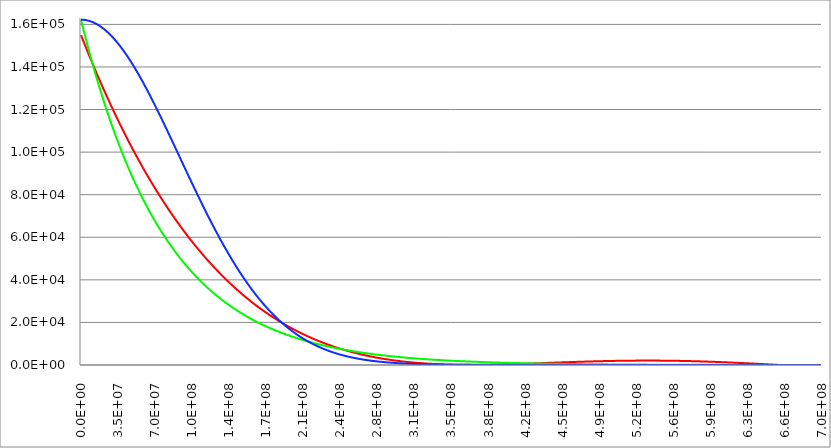
| Category | Series 1 | Series 0 | Series 2 |
|---|---|---|---|
| 0.0 | 155000 | 162200 | 162200 |
| 347850.0 | 154555.961 | 161490.775 | 162198.841 |
| 695700.0 | 154112.842 | 160784.651 | 162195.362 |
| 1043550.0 | 153670.644 | 160081.614 | 162189.565 |
| 1391400.0 | 153229.363 | 159381.651 | 162181.45 |
| 1739250.0 | 152789 | 158684.748 | 162171.017 |
| 2087100.0 | 152349.552 | 157990.891 | 162158.266 |
| 2434950.0 | 151911.019 | 157300.068 | 162143.197 |
| 2782800.0 | 151473.4 | 156612.265 | 162125.813 |
| 3130650.0 | 151036.693 | 155927.469 | 162106.113 |
| 3478500.0 | 150600.897 | 155245.667 | 162084.098 |
| 3826350.0 | 150166.01 | 154566.846 | 162059.769 |
| 4174200.0 | 149732.033 | 153890.992 | 162033.127 |
| 4522050.0 | 149298.962 | 153218.093 | 162004.173 |
| 4869900.0 | 148866.798 | 152548.136 | 161972.909 |
| 5217750.0 | 148435.539 | 151881.108 | 161939.336 |
| 5565600.0 | 148005.184 | 151216.996 | 161903.455 |
| 5913450.0 | 147575.731 | 150555.787 | 161865.268 |
| 6261300.0 | 147147.179 | 149897.47 | 161824.777 |
| 6609150.0 | 146719.528 | 149242.03 | 161781.982 |
| 6957000.0 | 146292.775 | 148589.455 | 161736.887 |
| 7304850.0 | 145866.92 | 147939.734 | 161689.493 |
| 7652700.0 | 145441.962 | 147292.853 | 161639.802 |
| 8000550.0 | 145017.899 | 146648.8 | 161587.815 |
| 8348400.0 | 144594.73 | 146007.563 | 161533.537 |
| 8696250.0 | 144172.454 | 145369.129 | 161476.968 |
| 9044100.0 | 143751.07 | 144733.487 | 161418.11 |
| 9391950.0 | 143330.576 | 144100.623 | 161356.968 |
| 9739800.0 | 142910.971 | 143470.526 | 161293.543 |
| 10087650.0 | 142492.255 | 142843.184 | 161227.838 |
| 10435500.0 | 142074.425 | 142218.584 | 161159.855 |
| 10783350.0 | 141657.481 | 141596.715 | 161089.598 |
| 11131200.0 | 141241.422 | 140977.565 | 161017.07 |
| 11479050.0 | 140826.245 | 140361.122 | 160942.274 |
| 11826900.0 | 140411.951 | 139747.373 | 160865.212 |
| 12174750.0 | 139998.538 | 139136.308 | 160785.889 |
| 12522600.0 | 139586.004 | 138527.914 | 160704.307 |
| 12870450.0 | 139174.349 | 137922.18 | 160620.47 |
| 13218300.0 | 138763.571 | 137319.095 | 160534.382 |
| 13566150.0 | 138353.67 | 136718.646 | 160446.047 |
| 13914000.0 | 137944.643 | 136120.822 | 160355.467 |
| 14261850.0 | 137536.49 | 135525.611 | 160262.648 |
| 14609700.0 | 137129.21 | 134933.003 | 160167.592 |
| 14957550.0 | 136722.8 | 134342.985 | 160070.304 |
| 15305400.0 | 136317.261 | 133755.547 | 159970.788 |
| 15653250.0 | 135912.591 | 133170.677 | 159869.049 |
| 16001100.0 | 135508.789 | 132588.365 | 159765.09 |
| 16348950.0 | 135105.853 | 132008.598 | 159658.916 |
| 16696800.0 | 134703.783 | 131431.365 | 159550.532 |
| 17044650.0 | 134302.577 | 130856.656 | 159439.942 |
| 17392500.0 | 133902.234 | 130284.46 | 159327.151 |
| 17740350.0 | 133502.753 | 129714.765 | 159212.163 |
| 18088200.0 | 133104.132 | 129147.561 | 159094.984 |
| 18436050.0 | 132706.371 | 128582.837 | 158975.618 |
| 18783900.0 | 132309.469 | 128020.581 | 158854.071 |
| 19131750.0 | 131913.423 | 127460.784 | 158730.348 |
| 19479600.0 | 131518.233 | 126903.434 | 158604.453 |
| 19827450.0 | 131123.898 | 126348.52 | 158476.393 |
| 20175300.0 | 130730.417 | 125796.033 | 158346.172 |
| 20523150.0 | 130337.788 | 125245.961 | 158213.796 |
| 20871000.0 | 129946.01 | 124698.293 | 158079.271 |
| 21218850.0 | 129555.083 | 124153.021 | 157942.602 |
| 21566700.0 | 129165.004 | 123610.132 | 157803.795 |
| 21914550.0 | 128775.773 | 123069.616 | 157662.857 |
| 22262400.0 | 128387.388 | 122531.463 | 157519.792 |
| 22610250.0 | 127999.849 | 121995.664 | 157374.607 |
| 22958100.0 | 127613.154 | 121462.206 | 157227.308 |
| 23305950.0 | 127227.302 | 120931.081 | 157077.902 |
| 23653800.0 | 126842.292 | 120402.278 | 156926.393 |
| 24001650.0 | 126458.123 | 119875.786 | 156772.79 |
| 24349500.0 | 126074.793 | 119351.597 | 156617.098 |
| 24697350.0 | 125692.301 | 118829.699 | 156459.324 |
| 25045200.0 | 125310.646 | 118310.082 | 156299.474 |
| 25393050.0 | 124929.828 | 117792.738 | 156137.555 |
| 25740900.0 | 124549.844 | 117277.655 | 155973.574 |
| 26088750.0 | 124170.694 | 116764.824 | 155807.538 |
| 26436600.0 | 123792.377 | 116254.235 | 155639.454 |
| 26784450.0 | 123414.891 | 115745.878 | 155469.328 |
| 27132300.0 | 123038.235 | 115239.744 | 155297.168 |
| 27480150.0 | 122662.408 | 114735.822 | 155122.98 |
| 27828000.0 | 122287.409 | 114234.104 | 154946.773 |
| 28175850.0 | 121913.236 | 113734.579 | 154768.554 |
| 28523700.0 | 121539.889 | 113237.238 | 154588.329 |
| 28871550.0 | 121167.367 | 112742.071 | 154406.107 |
| 29219400.0 | 120795.668 | 112249.069 | 154221.895 |
| 29567250.0 | 120424.79 | 111758.222 | 154035.7 |
| 29915100.0 | 120054.734 | 111269.521 | 153847.531 |
| 30262950.0 | 119685.497 | 110782.957 | 153657.395 |
| 30610800.0 | 119317.079 | 110298.52 | 153465.299 |
| 30958650.0 | 118949.479 | 109816.2 | 153271.253 |
| 31306500.0 | 118582.694 | 109335.99 | 153075.264 |
| 31654350.0 | 118216.725 | 108857.878 | 152877.339 |
| 32002200.0 | 117851.57 | 108381.857 | 152677.488 |
| 32350050.0 | 117487.228 | 107907.917 | 152475.718 |
| 32697900.0 | 117123.697 | 107436.049 | 152272.038 |
| 33045750.0 | 116760.977 | 106966.244 | 152066.456 |
| 33393600.0 | 116399.066 | 106498.493 | 151858.98 |
| 33741450.0 | 116037.964 | 106032.787 | 151649.62 |
| 34089300.0 | 115677.668 | 105569.117 | 151438.383 |
| 34437150.0 | 115318.179 | 105107.474 | 151225.278 |
| 34785000.0 | 114959.494 | 104647.849 | 151010.314 |
| 35132850.0 | 114601.613 | 104190.234 | 150793.5 |
| 35480700.0 | 114244.534 | 103734.619 | 150574.845 |
| 35828550.0 | 113888.257 | 103280.996 | 150354.357 |
| 36176400.0 | 113532.78 | 102829.356 | 150132.045 |
| 36524250.0 | 113178.102 | 102379.691 | 149907.919 |
| 36872100.0 | 112824.222 | 101931.992 | 149681.988 |
| 37219950.0 | 112471.138 | 101486.25 | 149454.261 |
| 37567800.0 | 112118.851 | 101042.456 | 149224.746 |
| 37915650.0 | 111767.358 | 100600.603 | 148993.454 |
| 38263500.0 | 111416.658 | 100160.682 | 148760.394 |
| 38611350.0 | 111066.75 | 99722.684 | 148525.575 |
| 38959200.0 | 110717.634 | 99286.6 | 148289.007 |
| 39307050.0 | 110369.308 | 98852.423 | 148050.699 |
| 39654900.0 | 110021.77 | 98420.145 | 147810.66 |
| 40002750.0 | 109675.02 | 97989.756 | 147568.901 |
| 40350600.0 | 109329.057 | 97561.249 | 147325.431 |
| 40698450.0 | 108983.879 | 97134.615 | 147080.261 |
| 41046300.0 | 108639.485 | 96709.846 | 146833.399 |
| 41394150.0 | 108295.875 | 96286.934 | 146584.855 |
| 41742000.0 | 107953.046 | 95865.872 | 146334.641 |
| 42089850.0 | 107610.999 | 95446.65 | 146082.765 |
| 42437700.0 | 107269.731 | 95029.261 | 145829.237 |
| 42785550.0 | 106929.242 | 94613.696 | 145574.069 |
| 43133400.0 | 106589.53 | 94199.949 | 145317.269 |
| 43481250.0 | 106250.595 | 93788.01 | 145058.849 |
| 43829100.0 | 105912.435 | 93377.872 | 144798.818 |
| 44176950.0 | 105575.049 | 92969.527 | 144537.186 |
| 44524800.0 | 105238.437 | 92562.968 | 144273.965 |
| 44872650.0 | 104902.596 | 92158.185 | 144009.165 |
| 45220500.0 | 104567.526 | 91755.173 | 143742.795 |
| 45568350.0 | 104233.225 | 91353.922 | 143474.867 |
| 45916200.0 | 103899.693 | 90954.426 | 143205.391 |
| 46264050.0 | 103566.929 | 90556.676 | 142934.378 |
| 46611900.0 | 103234.931 | 90160.665 | 142661.838 |
| 46959750.0 | 102903.698 | 89766.386 | 142387.782 |
| 47307600.0 | 102573.229 | 89373.83 | 142112.22 |
| 47655450.0 | 102243.523 | 88982.99 | 141835.165 |
| 48003300.0 | 101914.579 | 88593.859 | 141556.625 |
| 48351150.0 | 101586.395 | 88206.429 | 141276.613 |
| 48699000.0 | 101258.971 | 87820.693 | 140995.139 |
| 49046850.0 | 100932.306 | 87436.643 | 140712.214 |
| 49394700.0 | 100606.398 | 87054.273 | 140427.85 |
| 49742550.0 | 100281.246 | 86673.574 | 140142.056 |
| 50090400.0 | 99956.849 | 86294.539 | 139854.845 |
| 50438250.0 | 99633.207 | 85917.162 | 139566.227 |
| 50786100.0 | 99310.317 | 85541.434 | 139276.213 |
| 51133950.0 | 98988.179 | 85167.349 | 138984.815 |
| 51481800.0 | 98666.792 | 84794.899 | 138692.044 |
| 51829650.0 | 98346.154 | 84424.078 | 138397.911 |
| 52177500.0 | 98026.265 | 84054.878 | 138102.427 |
| 52525350.0 | 97707.124 | 83687.292 | 137805.604 |
| 52873200.0 | 97388.728 | 83321.313 | 137507.454 |
| 53221050.0 | 97071.078 | 82956.934 | 137207.986 |
| 53568900.0 | 96754.172 | 82594.148 | 136907.214 |
| 53916750.0 | 96438.008 | 82232.948 | 136605.148 |
| 54264600.0 | 96122.587 | 81873.327 | 136301.799 |
| 54612450.0 | 95807.906 | 81515.278 | 135997.181 |
| 54960300.0 | 95493.966 | 81158.795 | 135691.302 |
| 55308150.0 | 95180.763 | 80803.87 | 135384.177 |
| 55656000.0 | 94868.298 | 80450.497 | 135075.815 |
| 56003850.0 | 94556.57 | 80098.669 | 134766.229 |
| 56351700.0 | 94245.576 | 79748.378 | 134455.431 |
| 56699550.0 | 93935.317 | 79399.62 | 134143.431 |
| 57047400.0 | 93625.791 | 79052.386 | 133830.242 |
| 57395250.0 | 93316.997 | 78706.67 | 133515.876 |
| 57743100.0 | 93008.934 | 78362.465 | 133200.343 |
| 58090950.0 | 92701.601 | 78019.766 | 132883.657 |
| 58438800.0 | 92394.996 | 77678.564 | 132565.828 |
| 58786650.0 | 92089.119 | 77338.854 | 132246.869 |
| 59134500.0 | 91783.968 | 77000.63 | 131926.791 |
| 59482350.0 | 91479.543 | 76663.884 | 131605.606 |
| 59830200.0 | 91175.842 | 76328.61 | 131283.327 |
| 60178050.0 | 90872.865 | 75994.802 | 130959.964 |
| 60525900.0 | 90570.609 | 75662.453 | 130635.53 |
| 60873750.0 | 90269.075 | 75331.558 | 130310.037 |
| 61221600.0 | 89968.261 | 75002.109 | 129983.496 |
| 61569450.0 | 89668.165 | 74674.1 | 129655.921 |
| 61917300.0 | 89368.788 | 74347.525 | 129327.321 |
| 62265150.0 | 89070.127 | 74022.378 | 128997.711 |
| 62613000.0 | 88772.182 | 73698.653 | 128667.101 |
| 62960850.0 | 88474.951 | 73376.342 | 128335.503 |
| 63308700.0 | 88178.434 | 73055.441 | 128002.93 |
| 63656550.0 | 87882.629 | 72735.943 | 127669.394 |
| 64004400.0 | 87587.535 | 72417.842 | 127334.906 |
| 64352250.0 | 87293.152 | 72101.131 | 126999.48 |
| 64700100.0 | 86999.478 | 71785.805 | 126663.125 |
| 65047950.0 | 86706.512 | 71471.857 | 126325.856 |
| 65395800.0 | 86414.253 | 71159.282 | 125987.684 |
| 65743650.0 | 86122.7 | 70848.074 | 125648.62 |
| 66091500.0 | 85831.852 | 70538.226 | 125308.677 |
| 66439350.0 | 85541.707 | 70229.732 | 124967.868 |
| 66787200.0 | 85252.265 | 69922.588 | 124626.204 |
| 67135050.0 | 84963.525 | 69616.786 | 124283.697 |
| 67482900.0 | 84675.486 | 69312.321 | 123940.359 |
| 67830750.0 | 84388.146 | 69009.187 | 123596.203 |
| 68178600.0 | 84101.504 | 68707.379 | 123251.241 |
| 68526450.0 | 83815.56 | 68406.889 | 122905.484 |
| 68874300.0 | 83530.312 | 68107.714 | 122558.945 |
| 69222150.0 | 83245.759 | 67809.846 | 122211.636 |
| 69570000.0 | 82961.9 | 67513.281 | 121863.569 |
| 69917850.0 | 82678.734 | 67218.012 | 121514.756 |
| 70265700.0 | 82396.261 | 66924.035 | 121165.209 |
| 70613550.0 | 82114.478 | 66631.342 | 120814.941 |
| 70961400.0 | 81833.385 | 66339.929 | 120463.962 |
| 71309250.0 | 81552.981 | 66049.79 | 120112.287 |
| 71657100.0 | 81273.265 | 65760.919 | 119759.925 |
| 72004950.0 | 80994.235 | 65473.312 | 119406.891 |
| 72352800.0 | 80715.891 | 65186.961 | 119053.195 |
| 72700650.0 | 80438.232 | 64901.863 | 118698.849 |
| 73048500.0 | 80161.256 | 64618.011 | 118343.867 |
| 73396350.0 | 79884.963 | 64335.4 | 117988.259 |
| 73744200.0 | 79609.35 | 64054.024 | 117632.038 |
| 74092050.0 | 79334.419 | 63773.879 | 117275.216 |
| 74439900.0 | 79060.166 | 63494.958 | 116917.805 |
| 74787750.0 | 78786.592 | 63217.257 | 116559.816 |
| 75135600.0 | 78513.695 | 62940.77 | 116201.263 |
| 75483450.0 | 78241.474 | 62665.492 | 115842.156 |
| 75831300.0 | 77969.928 | 62391.417 | 115482.508 |
| 76179150.0 | 77699.056 | 62118.54 | 115122.331 |
| 76527000.0 | 77428.857 | 61846.856 | 114761.636 |
| 76874850.0 | 77159.33 | 61576.36 | 114400.436 |
| 77222700.0 | 76890.473 | 61307.047 | 114038.743 |
| 77570550.0 | 76622.287 | 61038.911 | 113676.568 |
| 77918400.0 | 76354.769 | 60771.947 | 113313.923 |
| 78266250.0 | 76087.919 | 60506.15 | 112950.82 |
| 78614100.0 | 75821.735 | 60241.516 | 112587.271 |
| 78961950.0 | 75556.218 | 59978.038 | 112223.288 |
| 79309800.0 | 75291.364 | 59715.712 | 111858.883 |
| 79657650.0 | 75027.175 | 59454.533 | 111494.066 |
| 80005500.0 | 74763.647 | 59194.496 | 111128.851 |
| 80353350.0 | 74500.781 | 58935.596 | 110763.249 |
| 80701200.0 | 74238.576 | 58677.828 | 110397.271 |
| 81049050.0 | 73977.029 | 58421.186 | 110030.929 |
| 81396900.0 | 73716.142 | 58165.667 | 109664.235 |
| 81744750.0 | 73455.911 | 57911.264 | 109297.201 |
| 82092600.0 | 73196.336 | 57657.974 | 108929.837 |
| 82440450.0 | 72937.417 | 57405.791 | 108562.157 |
| 82788300.0 | 72679.152 | 57154.711 | 108194.17 |
| 83136150.0 | 72421.54 | 56904.728 | 107825.89 |
| 83484000.0 | 72164.58 | 56655.838 | 107457.327 |
| 83831850.0 | 71908.271 | 56408.037 | 107088.492 |
| 84179700.0 | 71652.612 | 56161.319 | 106719.398 |
| 84527550.0 | 71397.602 | 55915.679 | 106350.056 |
| 84875400.0 | 71143.24 | 55671.113 | 105980.476 |
| 85223250.0 | 70889.524 | 55427.616 | 105610.672 |
| 85571100.0 | 70636.455 | 55185.184 | 105240.652 |
| 85918950.0 | 70384.03 | 54943.812 | 104870.431 |
| 86266800.0 | 70132.25 | 54703.495 | 104500.017 |
| 86614650.0 | 69881.112 | 54464.229 | 104129.423 |
| 86962500.0 | 69630.615 | 54226.009 | 103758.66 |
| 87310350.0 | 69380.76 | 53988.83 | 103387.739 |
| 87658200.0 | 69131.544 | 53752.688 | 103016.671 |
| 88006050.0 | 68882.966 | 53517.579 | 102645.468 |
| 88353900.0 | 68635.027 | 53283.497 | 102274.14 |
| 88701750.0 | 68387.724 | 53050.439 | 101902.698 |
| 89049600.0 | 68141.056 | 52818.399 | 101531.154 |
| 89397450.0 | 67895.023 | 52587.374 | 101159.519 |
| 89745300.0 | 67649.624 | 52357.359 | 100787.802 |
| 90093150.0 | 67404.857 | 52128.35 | 100416.016 |
| 90441000.0 | 67160.722 | 51900.342 | 100044.172 |
| 90788850.0 | 66917.217 | 51673.331 | 99672.279 |
| 91136700.0 | 66674.341 | 51447.312 | 99300.349 |
| 91484550.0 | 66432.094 | 51222.281 | 98928.392 |
| 91832400.0 | 66190.474 | 50998.234 | 98556.42 |
| 92180250.0 | 65949.481 | 50775.167 | 98184.443 |
| 92528100.0 | 65709.113 | 50553.074 | 97812.471 |
| 92875950.0 | 65469.37 | 50331.953 | 97440.516 |
| 93223800.0 | 65230.249 | 50111.798 | 97068.587 |
| 93571650.0 | 64991.751 | 49892.606 | 96696.695 |
| 93919500.0 | 64753.875 | 49674.372 | 96324.851 |
| 94267350.0 | 64516.619 | 49457.093 | 95953.065 |
| 94615200.0 | 64279.982 | 49240.763 | 95581.348 |
| 94963050.0 | 64043.963 | 49025.379 | 95209.709 |
| 95310900.0 | 63808.562 | 48810.936 | 94838.16 |
| 95658750.0 | 63573.776 | 48597.431 | 94466.71 |
| 96006600.0 | 63339.606 | 48384.86 | 94095.37 |
| 96354450.0 | 63106.051 | 48173.218 | 93724.149 |
| 96702300.0 | 62873.108 | 47962.501 | 93353.059 |
| 97050150.0 | 62640.778 | 47752.705 | 92982.108 |
| 97398000.0 | 62409.059 | 47543.827 | 92611.307 |
| 97745850.0 | 62177.95 | 47335.861 | 92240.667 |
| 98093700.0 | 61947.451 | 47128.805 | 91870.196 |
| 98441550.0 | 61717.559 | 46922.654 | 91499.905 |
| 98789400.0 | 61488.275 | 46717.405 | 91129.804 |
| 99137250.0 | 61259.597 | 46513.052 | 90759.902 |
| 99485100.0 | 61031.524 | 46309.593 | 90390.209 |
| 99832950.0 | 60804.056 | 46107.024 | 90020.735 |
| 100180800.0 | 60577.191 | 45905.34 | 89651.49 |
| 100528650.0 | 60350.927 | 45704.538 | 89282.483 |
| 100876500.0 | 60125.266 | 45504.614 | 88913.724 |
| 101224350.0 | 59900.204 | 45305.564 | 88545.221 |
| 101572200.0 | 59675.741 | 45107.384 | 88176.986 |
| 101920050.0 | 59451.877 | 44910.07 | 87809.026 |
| 102267900.0 | 59228.61 | 44713.619 | 87441.352 |
| 102615750.0 | 59005.939 | 44518.027 | 87073.972 |
| 102963600.0 | 58783.864 | 44323.29 | 86706.897 |
| 103311450.0 | 58562.382 | 44129.404 | 86340.134 |
| 103659300.0 | 58341.494 | 43936.366 | 85973.694 |
| 104007150.0 | 58121.198 | 43744.172 | 85607.585 |
| 104355000.0 | 57901.494 | 43552.819 | 85241.817 |
| 104702850.0 | 57682.379 | 43362.301 | 84876.398 |
| 105050700.0 | 57463.854 | 43172.617 | 84511.337 |
| 105398550.0 | 57245.918 | 42983.762 | 84146.643 |
| 105746400.0 | 57028.568 | 42795.733 | 83782.325 |
| 106094250.0 | 56811.805 | 42608.525 | 83418.392 |
| 106442100.0 | 56595.628 | 42422.136 | 83054.853 |
| 106789950.0 | 56380.034 | 42236.562 | 82691.715 |
| 107137800.0 | 56165.025 | 42051.799 | 82328.988 |
| 107485650.0 | 55950.597 | 41867.844 | 81966.681 |
| 107833500.0 | 55736.751 | 41684.694 | 81604.801 |
| 108181350.0 | 55523.485 | 41502.344 | 81243.358 |
| 108529200.0 | 55310.799 | 41320.791 | 80882.359 |
| 108877050.0 | 55098.691 | 41140.032 | 80521.813 |
| 109224900.0 | 54887.161 | 40960.063 | 80161.728 |
| 109572750.0 | 54676.207 | 40780.881 | 79802.112 |
| 109920600.0 | 54465.829 | 40602.482 | 79442.974 |
| 110268450.0 | 54256.025 | 40424.863 | 79084.322 |
| 110616300.0 | 54046.795 | 40248.021 | 78726.163 |
| 110964150.0 | 53838.138 | 40071.952 | 78368.506 |
| 111312000.0 | 53630.052 | 39896.652 | 78011.358 |
| 111659850.0 | 53422.537 | 39722.119 | 77654.728 |
| 112007700.0 | 53215.591 | 39548.349 | 77298.623 |
| 112355550.0 | 53009.214 | 39375.339 | 76943.052 |
| 112703400.0 | 52803.405 | 39203.085 | 76588.02 |
| 113051250.0 | 52598.163 | 39031.584 | 76233.538 |
| 113399100.0 | 52393.487 | 38860.833 | 75879.611 |
| 113746950.0 | 52189.375 | 38690.828 | 75526.247 |
| 114094800.0 | 51985.827 | 38521.567 | 75173.454 |
| 114442650.0 | 51782.842 | 38353.046 | 74821.24 |
| 114790500.0 | 51580.419 | 38185.261 | 74469.611 |
| 115138350.0 | 51378.557 | 38018.21 | 74118.575 |
| 115486200.0 | 51177.255 | 37851.889 | 73768.139 |
| 115834050.0 | 50976.512 | 37686.295 | 73418.31 |
| 116181900.0 | 50776.328 | 37521.426 | 73069.096 |
| 116529750.0 | 50576.7 | 37357.277 | 72720.503 |
| 116877600.0 | 50377.628 | 37193.846 | 72372.539 |
| 117225450.0 | 50179.112 | 37031.129 | 72025.209 |
| 117573300.0 | 49981.15 | 36869.123 | 71678.522 |
| 117921150.0 | 49783.741 | 36707.826 | 71332.484 |
| 118269000.0 | 49586.884 | 36547.234 | 70987.102 |
| 118616850.0 | 49390.579 | 36387.344 | 70642.382 |
| 118964700.0 | 49194.824 | 36228.154 | 70298.33 |
| 119312550.0 | 48999.618 | 36069.659 | 69954.955 |
| 119660400.0 | 48804.961 | 35911.857 | 69612.261 |
| 120008250.0 | 48610.852 | 35754.745 | 69270.256 |
| 120356100.0 | 48417.289 | 35598.319 | 68928.946 |
| 120703950.0 | 48224.272 | 35442.578 | 68588.337 |
| 121051800.0 | 48031.799 | 35287.517 | 68248.435 |
| 121399650.0 | 47839.87 | 35133.135 | 67909.247 |
| 121747500.0 | 47648.484 | 34979.427 | 67570.778 |
| 122095350.0 | 47457.64 | 34826.391 | 67233.035 |
| 122443200.0 | 47267.336 | 34674.025 | 66896.024 |
| 122791050.0 | 47077.573 | 34522.324 | 66559.751 |
| 123138900.0 | 46888.348 | 34371.287 | 66224.222 |
| 123486750.0 | 46699.661 | 34220.91 | 65889.441 |
| 123834600.0 | 46511.512 | 34071.191 | 65555.416 |
| 124182450.0 | 46323.898 | 33922.125 | 65222.152 |
| 124530300.0 | 46136.82 | 33773.712 | 64889.655 |
| 124878150.0 | 45950.276 | 33625.948 | 64557.929 |
| 125226000.0 | 45764.265 | 33478.829 | 64226.981 |
| 125573850.0 | 45578.787 | 33332.354 | 63896.816 |
| 125921700.0 | 45393.84 | 33186.519 | 63567.44 |
| 126269550.0 | 45209.424 | 33041.322 | 63238.857 |
| 126617400.0 | 45025.537 | 32896.759 | 62911.074 |
| 126965250.0 | 44842.178 | 32752.829 | 62584.095 |
| 127313100.0 | 44659.347 | 32609.527 | 62257.925 |
| 127660950.0 | 44477.043 | 32466.852 | 61932.569 |
| 128008800.0 | 44295.265 | 32324.801 | 61608.033 |
| 128356650.0 | 44114.012 | 32183.371 | 61284.322 |
| 128704500.0 | 43933.282 | 32042.559 | 60961.44 |
| 129052350.0 | 43753.076 | 31902.363 | 60639.392 |
| 129400200.0 | 43573.391 | 31762.78 | 60318.183 |
| 129748050.0 | 43394.228 | 31623.807 | 59997.818 |
| 130095900.0 | 43215.584 | 31485.442 | 59678.301 |
| 130443750.0 | 43037.46 | 31347.681 | 59359.637 |
| 130791600.0 | 42859.855 | 31210.523 | 59041.831 |
| 131139450.0 | 42682.766 | 31073.964 | 58724.886 |
| 131487300.0 | 42506.194 | 30938.003 | 58408.808 |
| 131835150.0 | 42330.138 | 30802.636 | 58093.6 |
| 132183000.0 | 42154.596 | 30667.86 | 57779.268 |
| 132530850.0 | 41979.568 | 30533.674 | 57465.815 |
| 132878700.0 | 41805.052 | 30400.075 | 57153.245 |
| 133226550.0 | 41631.049 | 30267.059 | 56841.563 |
| 133574400.0 | 41457.556 | 30134.625 | 56530.772 |
| 133922250.0 | 41284.573 | 30002.77 | 56220.877 |
| 134270100.0 | 41112.099 | 29871.492 | 55911.881 |
| 134617950.0 | 40940.134 | 29740.787 | 55603.789 |
| 134965800.0 | 40768.675 | 29610.654 | 55296.603 |
| 135313650.0 | 40597.723 | 29481.09 | 54990.329 |
| 135661500.0 | 40427.276 | 29352.092 | 54684.969 |
| 136009350.0 | 40257.334 | 29223.658 | 54380.528 |
| 136357200.0 | 40087.895 | 29095.786 | 54077.008 |
| 136705050.0 | 39918.959 | 28968.473 | 53774.413 |
| 137052900.0 | 39750.524 | 28841.716 | 53472.747 |
| 137400750.0 | 39582.59 | 28715.513 | 53172.014 |
| 137748600.0 | 39415.156 | 28589.863 | 52872.215 |
| 138096450.0 | 39248.221 | 28464.761 | 52573.356 |
| 138444300.0 | 39081.784 | 28340.207 | 52275.438 |
| 138792150.0 | 38915.844 | 28216.197 | 51978.466 |
| 139140000.0 | 38750.4 | 28092.729 | 51682.442 |
| 139487850.0 | 38585.451 | 27969.801 | 51387.369 |
| 139835700.0 | 38420.997 | 27847.41 | 51093.25 |
| 140183550.0 | 38257.037 | 27725.554 | 50800.088 |
| 140531400.0 | 38093.569 | 27604.232 | 50507.886 |
| 140879250.0 | 37930.592 | 27483.439 | 50216.648 |
| 141227100.0 | 37768.106 | 27363.175 | 49926.374 |
| 141574950.0 | 37606.11 | 27243.436 | 49637.069 |
| 141922800.0 | 37444.603 | 27124.221 | 49348.735 |
| 142270650.0 | 37283.584 | 27005.527 | 49061.375 |
| 142618500.0 | 37123.052 | 26887.352 | 48774.99 |
| 142966350.0 | 36963.007 | 26769.694 | 48489.584 |
| 143314200.0 | 36803.446 | 26652.55 | 48205.159 |
| 143662050.0 | 36644.37 | 26535.918 | 47921.717 |
| 144009900.0 | 36485.778 | 26419.796 | 47639.26 |
| 144357750.0 | 36327.668 | 26304.182 | 47357.791 |
| 144705600.0 | 36170.04 | 26189.073 | 47077.313 |
| 145053450.0 | 36012.893 | 26074.467 | 46797.826 |
| 145401300.0 | 35856.225 | 25960.363 | 46519.334 |
| 145749150.0 | 35700.037 | 25846.757 | 46241.837 |
| 146097000.0 | 35544.326 | 25733.648 | 45965.339 |
| 146444850.0 | 35389.093 | 25621.034 | 45689.841 |
| 146792700.0 | 35234.336 | 25508.911 | 45415.345 |
| 147140550.0 | 35080.055 | 25397.279 | 45141.853 |
| 147488400.0 | 34926.248 | 25286.135 | 44869.366 |
| 147836250.0 | 34772.915 | 25175.477 | 44597.887 |
| 148184100.0 | 34620.055 | 25065.303 | 44327.416 |
| 148531950.0 | 34467.666 | 24955.61 | 44057.956 |
| 148879800.0 | 34315.748 | 24846.397 | 43789.507 |
| 149227650.0 | 34164.301 | 24737.662 | 43522.072 |
| 149575500.0 | 34013.322 | 24629.401 | 43255.652 |
| 149923350.0 | 33862.812 | 24521.614 | 42990.249 |
| 150271200.0 | 33712.77 | 24414.299 | 42725.863 |
| 150619050.0 | 33563.193 | 24307.452 | 42462.495 |
| 150966900.0 | 33414.083 | 24201.073 | 42200.148 |
| 151314750.0 | 33265.437 | 24095.158 | 41938.823 |
| 151662600.0 | 33117.255 | 23989.707 | 41678.519 |
| 152010450.0 | 32969.536 | 23884.717 | 41419.239 |
| 152358300.0 | 32822.279 | 23780.186 | 41160.984 |
| 152706150.0 | 32675.484 | 23676.111 | 40903.754 |
| 153054000.0 | 32529.149 | 23572.492 | 40647.55 |
| 153401850.0 | 32383.273 | 23469.326 | 40392.374 |
| 153749700.0 | 32237.856 | 23366.61 | 40138.226 |
| 154097550.0 | 32092.896 | 23264.344 | 39885.107 |
| 154445400.0 | 31948.393 | 23162.525 | 39633.017 |
| 154793250.0 | 31804.347 | 23061.151 | 39381.958 |
| 155141100.0 | 31660.755 | 22960.22 | 39131.929 |
| 155488950.0 | 31517.618 | 22859.731 | 38882.932 |
| 155836800.0 | 31374.933 | 22759.681 | 38634.968 |
| 156184650.0 | 31232.702 | 22660.068 | 38388.035 |
| 156532500.0 | 31090.921 | 22560.89 | 38142.136 |
| 156880350.0 | 30949.592 | 22462.147 | 37897.27 |
| 157228200.0 | 30808.712 | 22363.835 | 37653.437 |
| 157576050.0 | 30668.282 | 22265.952 | 37410.639 |
| 157923900.0 | 30528.299 | 22168.498 | 37168.874 |
| 158271750.0 | 30388.764 | 22071.47 | 36928.145 |
| 158619600.0 | 30249.675 | 21974.866 | 36688.449 |
| 158967450.0 | 30111.031 | 21878.684 | 36449.789 |
| 159315300.0 | 29972.832 | 21782.923 | 36212.163 |
| 159663150.0 | 29835.077 | 21687.58 | 35975.573 |
| 160011000.0 | 29697.765 | 21592.655 | 35740.016 |
| 160358850.0 | 29560.894 | 21498.144 | 35505.495 |
| 160706700.0 | 29424.465 | 21404.046 | 35272.009 |
| 161054550.0 | 29288.477 | 21310.36 | 35039.556 |
| 161402400.0 | 29152.927 | 21217.083 | 34808.138 |
| 161750250.0 | 29017.816 | 21124.215 | 34577.755 |
| 162098100.0 | 28883.143 | 21031.752 | 34348.405 |
| 162445950.0 | 28748.907 | 20939.693 | 34120.088 |
| 162793800.0 | 28615.106 | 20848.037 | 33892.804 |
| 163141650.0 | 28481.741 | 20756.782 | 33666.554 |
| 163489500.0 | 28348.81 | 20665.925 | 33441.335 |
| 163837350.0 | 28216.313 | 20575.466 | 33217.148 |
| 164185200.0 | 28084.248 | 20485.402 | 32993.993 |
| 164533050.0 | 27952.614 | 20395.732 | 32771.868 |
| 164880900.0 | 27821.412 | 20306.454 | 32550.773 |
| 165228750.0 | 27690.64 | 20217.567 | 32330.707 |
| 165576600.0 | 27560.296 | 20129.068 | 32111.67 |
| 165924450.0 | 27430.381 | 20040.956 | 31893.661 |
| 166272300.0 | 27300.894 | 19953.229 | 31676.68 |
| 166620150.0 | 27171.833 | 19865.885 | 31460.725 |
| 166968000.0 | 27043.197 | 19778.924 | 31245.795 |
| 167315850.0 | 26914.987 | 19692.342 | 31031.89 |
| 167663700.0 | 26787.201 | 19606.139 | 30819.009 |
| 168011550.0 | 26659.838 | 19520.313 | 30607.15 |
| 168359400.0 | 26532.897 | 19434.863 | 30396.314 |
| 168707250.0 | 26406.377 | 19349.785 | 30186.498 |
| 169055100.0 | 26280.279 | 19265.08 | 29977.702 |
| 169402950.0 | 26154.6 | 19180.745 | 29769.925 |
| 169750800.0 | 26029.34 | 19096.779 | 29563.164 |
| 170098650.0 | 25904.498 | 19013.18 | 29357.421 |
| 170446500.0 | 25780.074 | 18929.946 | 29152.692 |
| 170794350.0 | 25656.065 | 18847.076 | 28948.977 |
| 171142200.0 | 25532.473 | 18764.569 | 28746.275 |
| 171490050.0 | 25409.295 | 18682.422 | 28544.584 |
| 171837900.0 | 25286.531 | 18600.634 | 28343.903 |
| 172185750.0 | 25164.181 | 18519.204 | 28144.23 |
| 172533600.0 | 25042.242 | 18438.13 | 27945.565 |
| 172881450.0 | 24920.715 | 18357.41 | 27747.905 |
| 173229300.0 | 24799.598 | 18277.044 | 27551.25 |
| 173577150.0 | 24678.892 | 18197.028 | 27355.597 |
| 173925000.0 | 24558.594 | 18117.363 | 27160.945 |
| 174272850.0 | 24438.704 | 18038.045 | 26967.292 |
| 174620700.0 | 24319.221 | 17959.075 | 26774.638 |
| 174968550.0 | 24200.145 | 17880.45 | 26582.98 |
| 175316400.0 | 24081.474 | 17802.168 | 26392.316 |
| 175664250.0 | 23963.208 | 17724.229 | 26202.645 |
| 176012100.0 | 23845.346 | 17646.63 | 26013.966 |
| 176359950.0 | 23727.887 | 17569.371 | 25826.276 |
| 176707800.0 | 23610.831 | 17492.449 | 25639.573 |
| 177055650.0 | 23494.176 | 17415.864 | 25453.857 |
| 177403500.0 | 23377.921 | 17339.614 | 25269.124 |
| 177751350.0 | 23262.066 | 17263.696 | 25085.373 |
| 178099200.0 | 23146.61 | 17188.111 | 24902.603 |
| 178447050.0 | 23031.552 | 17112.857 | 24720.811 |
| 178794900.0 | 22916.892 | 17037.931 | 24539.995 |
| 179142750.0 | 22802.627 | 16963.333 | 24360.153 |
| 179490600.0 | 22688.759 | 16889.061 | 24181.284 |
| 179838450.0 | 22575.285 | 16815.113 | 24003.385 |
| 180186300.0 | 22462.206 | 16741.489 | 23826.454 |
| 180534150.0 | 22349.519 | 16668.187 | 23650.489 |
| 180882000.0 | 22237.225 | 16595.205 | 23475.488 |
| 181229850.0 | 22125.323 | 16522.543 | 23301.448 |
| 181577700.0 | 22013.811 | 16450.198 | 23128.369 |
| 181925550.0 | 21902.689 | 16378.169 | 22956.247 |
| 182273400.0 | 21791.957 | 16306.455 | 22785.079 |
| 182621250.0 | 21681.612 | 16235.055 | 22614.865 |
| 182969100.0 | 21571.655 | 16163.967 | 22445.602 |
| 183316950.0 | 21462.085 | 16093.189 | 22277.287 |
| 183664800.0 | 21352.901 | 16022.721 | 22109.918 |
| 184012650.0 | 21244.101 | 15952.562 | 21943.493 |
| 184360500.0 | 21135.686 | 15882.708 | 21778.009 |
| 184708350.0 | 21027.654 | 15813.161 | 21613.464 |
| 185056200.0 | 20920.005 | 15743.917 | 21449.856 |
| 185404050.0 | 20812.738 | 15674.976 | 21287.181 |
| 185751900.0 | 20705.851 | 15606.336 | 21125.439 |
| 186099750.0 | 20599.345 | 15537.997 | 20964.626 |
| 186447600.0 | 20493.218 | 15469.956 | 20804.739 |
| 186795450.0 | 20387.47 | 15402.213 | 20645.777 |
| 187143300.0 | 20282.1 | 15334.766 | 20487.736 |
| 187491150.0 | 20177.106 | 15267.614 | 20330.615 |
| 187839000.0 | 20072.489 | 15200.755 | 20174.41 |
| 188186850.0 | 19968.247 | 15134.189 | 20019.119 |
| 188534700.0 | 19864.379 | 15067.914 | 19864.739 |
| 188882550.0 | 19760.886 | 15001.928 | 19711.268 |
| 189230400.0 | 19657.765 | 14936.231 | 19558.703 |
| 189578250.0 | 19555.016 | 14870.821 | 19407.042 |
| 189926100.0 | 19452.639 | 14805.697 | 19256.281 |
| 190273950.0 | 19350.632 | 14740.858 | 19106.418 |
| 190621800.0 | 19248.995 | 14676.302 | 18957.45 |
| 190969650.0 | 19147.728 | 14612.029 | 18809.375 |
| 191317500.0 | 19046.828 | 14548.036 | 18662.19 |
| 191665350.0 | 18946.295 | 14484.323 | 18515.892 |
| 192013200.0 | 18846.129 | 14420.889 | 18370.478 |
| 192361050.0 | 18746.329 | 14357.732 | 18225.946 |
| 192708900.0 | 18646.894 | 14294.852 | 18082.292 |
| 193056750.0 | 18547.824 | 14232.246 | 17939.514 |
| 193404600.0 | 18449.116 | 14169.913 | 17797.609 |
| 193752450.0 | 18350.771 | 14107.854 | 17656.574 |
| 194100300.0 | 18252.788 | 14046.066 | 17516.406 |
| 194448150.0 | 18155.166 | 13984.547 | 17377.102 |
| 194796000.0 | 18057.905 | 13923.298 | 17238.66 |
| 195143850.0 | 17961.002 | 13862.317 | 17101.076 |
| 195491700.0 | 17864.459 | 13801.602 | 16964.348 |
| 195839550.0 | 17768.273 | 13741.152 | 16828.473 |
| 196187400.0 | 17672.445 | 13680.967 | 16693.447 |
| 196535250.0 | 17576.973 | 13621.045 | 16559.268 |
| 196883100.0 | 17481.856 | 13561.385 | 16425.932 |
| 197230950.0 | 17387.094 | 13501.986 | 16293.437 |
| 197578800.0 | 17292.686 | 13442.846 | 16161.78 |
| 197926650.0 | 17198.631 | 13383.965 | 16030.957 |
| 198274500.0 | 17104.929 | 13325.341 | 15900.966 |
| 198622350.0 | 17011.578 | 13266.974 | 15771.804 |
| 198970200.0 | 16918.579 | 13208.862 | 15643.467 |
| 199318050.0 | 16825.929 | 13151.004 | 15515.953 |
| 199665900.0 | 16733.629 | 13093.399 | 15389.258 |
| 200013750.0 | 16641.677 | 13036.045 | 15263.379 |
| 200361600.0 | 16550.073 | 12978.943 | 15138.314 |
| 200709450.0 | 16458.816 | 12922.09 | 15014.058 |
| 201057300.0 | 16367.905 | 12865.486 | 14890.61 |
| 201405150.0 | 16277.339 | 12809.129 | 14767.966 |
| 201753000.0 | 16187.118 | 12753.018 | 14646.122 |
| 202100850.0 | 16097.241 | 12697.153 | 14525.076 |
| 202448700.0 | 16007.708 | 12641.532 | 14404.824 |
| 202796550.0 | 15918.516 | 12586.154 | 14285.364 |
| 203144400.0 | 15829.666 | 12531.019 | 14166.692 |
| 203492250.0 | 15741.157 | 12476.124 | 14048.805 |
| 203840100.0 | 15652.988 | 12421.469 | 13931.699 |
| 204187950.0 | 15565.159 | 12367.054 | 13815.373 |
| 204535800.0 | 15477.668 | 12312.876 | 13699.821 |
| 204883650.0 | 15390.514 | 12258.935 | 13585.042 |
| 205231500.0 | 15303.698 | 12205.23 | 13471.032 |
| 205579350.0 | 15217.218 | 12151.759 | 13357.788 |
| 205927200.0 | 15131.073 | 12098.523 | 13245.307 |
| 206275050.0 | 15045.263 | 12045.519 | 13133.585 |
| 206622900.0 | 14959.787 | 11992.747 | 13022.619 |
| 206970750.0 | 14874.644 | 11940.205 | 12912.406 |
| 207318600.0 | 14789.833 | 11887.894 | 12802.943 |
| 207666450.0 | 14705.354 | 11835.811 | 12694.226 |
| 208014300.0 | 14621.206 | 11783.955 | 12586.252 |
| 208362150.0 | 14537.388 | 11732.327 | 12479.019 |
| 208710000.0 | 14453.9 | 11680.924 | 12372.522 |
| 209057850.0 | 14370.74 | 11629.746 | 12266.759 |
| 209405700.0 | 14287.908 | 11578.791 | 12161.726 |
| 209753550.0 | 14205.403 | 11528.06 | 12057.42 |
| 210101400.0 | 14123.225 | 11477.55 | 11953.837 |
| 210449250.0 | 14041.372 | 11427.261 | 11850.975 |
| 210797100.0 | 13959.844 | 11377.191 | 11748.83 |
| 211144950.0 | 13878.64 | 11327.341 | 11647.399 |
| 211492800.0 | 13797.76 | 11277.709 | 11546.679 |
| 211840650.0 | 13717.202 | 11228.293 | 11446.666 |
| 212188500.0 | 13636.966 | 11179.094 | 11347.357 |
| 212536350.0 | 13557.051 | 11130.11 | 11248.749 |
| 212884200.0 | 13477.456 | 11081.34 | 11150.838 |
| 213232050.0 | 13398.182 | 11032.783 | 11053.621 |
| 213579900.0 | 13319.226 | 10984.438 | 10957.096 |
| 213927750.0 | 13240.588 | 10936.305 | 10861.258 |
| 214275600.0 | 13162.267 | 10888.382 | 10766.104 |
| 214623450.0 | 13084.263 | 10840.669 | 10671.631 |
| 214971300.0 | 13006.575 | 10793.164 | 10577.836 |
| 215319150.0 | 12929.202 | 10745.867 | 10484.716 |
| 215667000.0 | 12852.144 | 10698.777 | 10392.267 |
| 216014850.0 | 12775.399 | 10651.893 | 10300.486 |
| 216362700.0 | 12698.967 | 10605.213 | 10209.369 |
| 216710550.0 | 12622.848 | 10558.738 | 10118.914 |
| 217058400.0 | 12547.04 | 10512.466 | 10029.117 |
| 217406250.0 | 12471.542 | 10466.396 | 9939.974 |
| 217754100.0 | 12396.355 | 10420.527 | 9851.483 |
| 218101950.0 | 12321.477 | 10374.86 | 9763.64 |
| 218449800.0 | 12246.907 | 10329.391 | 9676.443 |
| 218797650.0 | 12172.645 | 10284.122 | 9589.886 |
| 219145500.0 | 12098.69 | 10239.05 | 9503.969 |
| 219493350.0 | 12025.042 | 10194.176 | 9418.686 |
| 219841200.0 | 11951.699 | 10149.497 | 9334.035 |
| 220189050.0 | 11878.661 | 10105.014 | 9250.013 |
| 220536900.0 | 11805.927 | 10060.726 | 9166.616 |
| 220884750.0 | 11733.497 | 10016.631 | 9083.841 |
| 221232600.0 | 11661.369 | 9972.729 | 9001.685 |
| 221580450.0 | 11589.543 | 9929.019 | 8920.144 |
| 221928300.0 | 11518.018 | 9885.5 | 8839.215 |
| 222276150.0 | 11446.794 | 9842.171 | 8758.896 |
| 222624000.0 | 11375.869 | 9799.031 | 8679.182 |
| 222971850.0 | 11305.244 | 9756.08 | 8600.071 |
| 223319700.0 | 11234.917 | 9713.317 | 8521.559 |
| 223667550.0 | 11164.887 | 9670.741 | 8443.643 |
| 224015400.0 | 11095.155 | 9628.351 | 8366.32 |
| 224363250.0 | 11025.718 | 9586.147 | 8289.587 |
| 224711100.0 | 10956.577 | 9544.127 | 8213.44 |
| 225058950.0 | 10887.731 | 9502.29 | 8137.876 |
| 225406800.0 | 10819.178 | 9460.637 | 8062.892 |
| 225754650.0 | 10750.919 | 9419.165 | 7988.484 |
| 226102500.0 | 10682.953 | 9377.875 | 7914.651 |
| 226450350.0 | 10615.278 | 9336.766 | 7841.387 |
| 226798200.0 | 10547.894 | 9295.836 | 7768.691 |
| 227146050.0 | 10480.801 | 9255.085 | 7696.558 |
| 227493900.0 | 10413.998 | 9214.512 | 7624.986 |
| 227841750.0 | 10347.483 | 9174.117 | 7553.972 |
| 228189600.0 | 10281.257 | 9133.898 | 7483.512 |
| 228537450.0 | 10215.318 | 9093.855 | 7413.604 |
| 228885300.0 | 10149.666 | 9053.987 | 7344.243 |
| 229233150.0 | 10084.3 | 9014.293 | 7275.428 |
| 229581000.0 | 10019.22 | 8974.773 | 7207.154 |
| 229928850.0 | 9954.424 | 8935.426 | 7139.419 |
| 230276700.0 | 9889.913 | 8896.251 | 7072.219 |
| 230624550.0 | 9825.684 | 8857.247 | 7005.552 |
| 230972400.0 | 9761.739 | 8818.413 | 6939.413 |
| 231320250.0 | 9698.075 | 8779.75 | 6873.801 |
| 231668100.0 | 9634.692 | 8741.255 | 6808.712 |
| 232015950.0 | 9571.59 | 8702.928 | 6744.143 |
| 232363800.0 | 9508.767 | 8664.77 | 6680.091 |
| 232711650.0 | 9446.224 | 8626.778 | 6616.553 |
| 233059500.0 | 9383.959 | 8588.952 | 6553.525 |
| 233407350.0 | 9321.971 | 8551.291 | 6491.005 |
| 233755200.0 | 9260.261 | 8513.795 | 6428.989 |
| 234103050.0 | 9198.827 | 8476.463 | 6367.475 |
| 234450900.0 | 9137.668 | 8439.295 | 6306.459 |
| 234798750.0 | 9076.784 | 8402.288 | 6245.938 |
| 235146600.0 | 9016.175 | 8365.444 | 6185.91 |
| 235494450.0 | 8955.838 | 8328.76 | 6126.372 |
| 235842300.0 | 8895.775 | 8292.237 | 6067.319 |
| 236190150.0 | 8835.984 | 8255.874 | 6008.75 |
| 236538000.0 | 8776.464 | 8219.67 | 5950.661 |
| 236885850.0 | 8717.215 | 8183.624 | 5893.05 |
| 237233700.0 | 8658.235 | 8147.735 | 5835.913 |
| 237581550.0 | 8599.525 | 8112.004 | 5779.247 |
| 237929400.0 | 8541.084 | 8076.428 | 5723.049 |
| 238277250.0 | 8482.911 | 8041.008 | 5667.317 |
| 238625100.0 | 8425.005 | 8005.743 | 5612.048 |
| 238972950.0 | 8367.365 | 7970.632 | 5557.238 |
| 239320800.0 | 8309.991 | 7935.675 | 5502.885 |
| 239668650.0 | 8252.883 | 7900.871 | 5448.985 |
| 240016500.0 | 8196.039 | 7866.218 | 5395.536 |
| 240364350.0 | 8139.458 | 7831.717 | 5342.535 |
| 240712200.0 | 8083.141 | 7797.367 | 5289.98 |
| 241060050.0 | 8027.086 | 7763.167 | 5237.866 |
| 241407900.0 | 7971.293 | 7729.117 | 5186.191 |
| 241755750.0 | 7915.761 | 7695.216 | 5134.953 |
| 242103600.0 | 7860.49 | 7661.462 | 5084.149 |
| 242451450.0 | 7805.478 | 7627.857 | 5033.775 |
| 242799300.0 | 7750.725 | 7594.398 | 4983.829 |
| 243147150.0 | 7696.231 | 7561.085 | 4934.308 |
| 243495000.0 | 7641.994 | 7527.919 | 4885.209 |
| 243842850.0 | 7588.014 | 7494.897 | 4836.529 |
| 244190700.0 | 7534.29 | 7462.019 | 4788.267 |
| 244538550.0 | 7480.822 | 7429.285 | 4740.418 |
| 244886400.0 | 7427.609 | 7396.695 | 4692.98 |
| 245234250.0 | 7374.651 | 7364.247 | 4645.95 |
| 245582100.0 | 7321.946 | 7331.94 | 4599.326 |
| 245929950.0 | 7269.493 | 7299.775 | 4553.105 |
| 246277800.0 | 7217.294 | 7267.751 | 4507.284 |
| 246625650.0 | 7165.345 | 7235.866 | 4461.86 |
| 246973500.0 | 7113.648 | 7204.121 | 4416.831 |
| 247321350.0 | 7062.201 | 7172.515 | 4372.193 |
| 247669200.0 | 7011.003 | 7141.047 | 4327.945 |
| 248017050.0 | 6960.054 | 7109.716 | 4284.084 |
| 248364900.0 | 6909.354 | 7078.523 | 4240.606 |
| 248712750.0 | 6858.901 | 7047.466 | 4197.51 |
| 249060600.0 | 6808.695 | 7016.544 | 4154.792 |
| 249408450.0 | 6758.735 | 6985.758 | 4112.45 |
| 249756300.0 | 6709.021 | 6955.106 | 4070.482 |
| 250104150.0 | 6659.552 | 6924.589 | 4028.884 |
| 250452000.0 | 6610.327 | 6894.205 | 3987.654 |
| 250799850.0 | 6561.346 | 6863.953 | 3946.79 |
| 251147700.0 | 6512.607 | 6833.834 | 3906.289 |
| 251495550.0 | 6464.111 | 6803.847 | 3866.148 |
| 251843400.0 | 6415.856 | 6773.99 | 3826.364 |
| 252191250.0 | 6367.843 | 6744.265 | 3786.937 |
| 252539100.0 | 6320.069 | 6714.669 | 3747.861 |
| 252886950.0 | 6272.536 | 6685.202 | 3709.136 |
| 253234800.0 | 6225.241 | 6655.865 | 3670.759 |
| 253582650.0 | 6178.184 | 6626.655 | 3632.726 |
| 253930500.0 | 6131.366 | 6597.574 | 3595.037 |
| 254278350.0 | 6084.784 | 6568.619 | 3557.687 |
| 254626200.0 | 6038.438 | 6539.791 | 3520.676 |
| 254974050.0 | 5992.329 | 6511.089 | 3483.999 |
| 255321900.0 | 5946.454 | 6482.513 | 3447.655 |
| 255669750.0 | 5900.814 | 6454.061 | 3411.642 |
| 256017600.0 | 5855.407 | 6425.734 | 3375.956 |
| 256365450.0 | 5810.234 | 6397.531 | 3340.596 |
| 256713300.0 | 5765.293 | 6369.451 | 3305.56 |
| 257061150.0 | 5720.584 | 6341.494 | 3270.843 |
| 257409000.0 | 5676.106 | 6313.659 | 3236.446 |
| 257756850.0 | 5631.858 | 6285.945 | 3202.364 |
| 258104700.0 | 5587.84 | 6258.353 | 3168.595 |
| 258452550.0 | 5544.052 | 6230.882 | 3135.138 |
| 258800400.0 | 5500.492 | 6203.53 | 3101.99 |
| 259148250.0 | 5457.16 | 6176.299 | 3069.149 |
| 259496100.0 | 5414.055 | 6149.186 | 3036.612 |
| 259843950.0 | 5371.177 | 6122.191 | 3004.377 |
| 260191800.0 | 5328.525 | 6095.315 | 2972.441 |
| 260539650.0 | 5286.098 | 6068.556 | 2940.803 |
| 260887500.0 | 5243.896 | 6041.915 | 2909.46 |
| 261235350.0 | 5201.919 | 6015.389 | 2878.41 |
| 261583200.0 | 5160.164 | 5988.98 | 2847.651 |
| 261931050.0 | 5118.632 | 5962.686 | 2817.18 |
| 262278900.0 | 5077.323 | 5936.507 | 2786.995 |
| 262626750.0 | 5036.235 | 5910.443 | 2757.094 |
| 262974600.0 | 4995.368 | 5884.492 | 2727.475 |
| 263322450.0 | 4954.721 | 5858.655 | 2698.136 |
| 263670300.0 | 4914.294 | 5832.931 | 2669.074 |
| 264018150.0 | 4874.086 | 5807.32 | 2640.287 |
| 264366000.0 | 4834.096 | 5781.82 | 2611.774 |
| 264713850.0 | 4794.324 | 5756.432 | 2583.532 |
| 265061700.0 | 4754.769 | 5731.155 | 2555.558 |
| 265409550.0 | 4715.43 | 5705.988 | 2527.851 |
| 265757400.0 | 4676.308 | 5680.931 | 2500.409 |
| 266105250.0 | 4637.4 | 5655.984 | 2473.229 |
| 266453100.0 | 4598.707 | 5631.146 | 2446.31 |
| 266800950.0 | 4560.228 | 5606.417 | 2419.649 |
| 267148800.0 | 4521.963 | 5581.795 | 2393.245 |
| 267496650.0 | 4483.91 | 5557.282 | 2367.095 |
| 267844500.0 | 4446.069 | 5532.875 | 2341.197 |
| 268192350.0 | 4408.44 | 5508.575 | 2315.549 |
| 268540200.0 | 4371.021 | 5484.382 | 2290.15 |
| 268888050.0 | 4333.813 | 5460.294 | 2264.996 |
| 269235900.0 | 4296.814 | 5436.311 | 2240.088 |
| 269583750.0 | 4260.024 | 5412.434 | 2215.421 |
| 269931600.0 | 4223.443 | 5388.66 | 2190.994 |
| 270279450.0 | 4187.069 | 5364.991 | 2166.806 |
| 270627300.0 | 4150.903 | 5341.425 | 2142.855 |
| 270975150.0 | 4114.943 | 5317.962 | 2119.137 |
| 271323000.0 | 4079.189 | 5294.602 | 2095.653 |
| 271670850.0 | 4043.64 | 5271.344 | 2072.399 |
| 272018700.0 | 4008.296 | 5248.187 | 2049.374 |
| 272366550.0 | 3973.156 | 5225.132 | 2026.575 |
| 272714400.0 | 3938.219 | 5202.178 | 2004.002 |
| 273062250.0 | 3903.485 | 5179.324 | 1981.651 |
| 273410100.0 | 3868.953 | 5156.569 | 1959.522 |
| 273757950.0 | 3834.623 | 5133.915 | 1937.612 |
| 274105800.0 | 3800.494 | 5111.359 | 1915.92 |
| 274453650.0 | 3766.565 | 5088.902 | 1894.444 |
| 274801500.0 | 3732.836 | 5066.543 | 1873.182 |
| 275149350.0 | 3699.306 | 5044.282 | 1852.131 |
| 275497200.0 | 3665.975 | 5022.118 | 1831.292 |
| 275845050.0 | 3632.842 | 5000.051 | 1810.66 |
| 276192900.0 | 3599.906 | 4978.081 | 1790.236 |
| 276540750.0 | 3567.167 | 4956.207 | 1770.017 |
| 276888600.0 | 3534.623 | 4934.428 | 1750.001 |
| 277236450.0 | 3502.276 | 4912.744 | 1730.186 |
| 277584300.0 | 3470.123 | 4891.156 | 1710.572 |
| 277932150.0 | 3438.165 | 4869.661 | 1691.155 |
| 278280000.0 | 3406.4 | 4848.261 | 1671.936 |
| 278627850.0 | 3374.828 | 4826.954 | 1652.911 |
| 278975700.0 | 3343.449 | 4805.741 | 1634.079 |
| 279323550.0 | 3312.262 | 4784.62 | 1615.438 |
| 279671400.0 | 3281.267 | 4763.591 | 1596.988 |
| 280019250.0 | 3250.462 | 4742.654 | 1578.725 |
| 280367100.0 | 3219.847 | 4721.809 | 1560.649 |
| 280714950.0 | 3189.421 | 4701.055 | 1542.758 |
| 281062800.0 | 3159.185 | 4680.392 | 1525.051 |
| 281410650.0 | 3129.137 | 4659.819 | 1507.524 |
| 281758500.0 | 3099.276 | 4639.336 | 1490.179 |
| 282106350.0 | 3069.603 | 4618.943 | 1473.011 |
| 282454200.0 | 3040.117 | 4598.639 | 1456.021 |
| 282802050.0 | 3010.816 | 4578.423 | 1439.206 |
| 283149900.0 | 2981.701 | 4558.296 | 1422.565 |
| 283497750.0 | 2952.77 | 4538.257 | 1406.096 |
| 283845600.0 | 2924.024 | 4518.305 | 1389.798 |
| 284193450.0 | 2895.461 | 4498.441 | 1373.669 |
| 284541300.0 | 2867.082 | 4478.664 | 1357.708 |
| 284889150.0 | 2838.885 | 4458.973 | 1341.913 |
| 285237000.0 | 2810.87 | 4439.368 | 1326.283 |
| 285584850.0 | 2783.036 | 4419.849 | 1310.816 |
| 285932700.0 | 2755.382 | 4400.415 | 1295.512 |
| 286280550.0 | 2727.909 | 4381.066 | 1280.367 |
| 286628400.0 | 2700.616 | 4361.801 | 1265.382 |
| 286976250.0 | 2673.501 | 4342.621 | 1250.554 |
| 287324100.0 | 2646.565 | 4323.525 | 1235.882 |
| 287671950.0 | 2619.806 | 4304.512 | 1221.365 |
| 288019800.0 | 2593.225 | 4285.583 | 1207.001 |
| 288367650.0 | 2566.82 | 4266.736 | 1192.789 |
| 288715500.0 | 2540.592 | 4247.971 | 1178.727 |
| 289063350.0 | 2514.539 | 4229.289 | 1164.814 |
| 289411200.0 | 2488.66 | 4210.688 | 1151.05 |
| 289759050.0 | 2462.956 | 4192.169 | 1137.431 |
| 290106900.0 | 2437.426 | 4173.73 | 1123.958 |
| 290454750.0 | 2412.069 | 4155.373 | 1110.629 |
| 290802600.0 | 2386.885 | 4137.095 | 1097.442 |
| 291150450.0 | 2361.873 | 4118.897 | 1084.395 |
| 291498300.0 | 2337.032 | 4100.779 | 1071.489 |
| 291846150.0 | 2312.362 | 4082.74 | 1058.721 |
| 292194000.0 | 2287.862 | 4064.78 | 1046.091 |
| 292541850.0 | 2263.532 | 4046.899 | 1033.596 |
| 292889700.0 | 2239.372 | 4029.095 | 1021.236 |
| 293237550.0 | 2215.38 | 4011.37 | 1009.009 |
| 293585400.0 | 2191.556 | 3993.722 | 996.915 |
| 293933250.0 | 2167.899 | 3976.151 | 984.951 |
| 294281100.0 | 2144.409 | 3958.657 | 973.117 |
| 294628950.0 | 2121.086 | 3941.239 | 961.411 |
| 294976800.0 | 2097.929 | 3923.898 | 949.833 |
| 295324650.0 | 2074.937 | 3906.632 | 938.381 |
| 295672500.0 | 2052.109 | 3889.442 | 927.053 |
| 296020350.0 | 2029.446 | 3872.327 | 915.849 |
| 296368200.0 | 2006.946 | 3855.287 | 904.768 |
| 296716050.0 | 1984.609 | 3838.321 | 893.808 |
| 297063900.0 | 1962.434 | 3821.429 | 882.968 |
| 297411750.0 | 1940.422 | 3804.612 | 872.247 |
| 297759600.0 | 1918.57 | 3787.868 | 861.644 |
| 298107450.0 | 1896.88 | 3771.197 | 851.157 |
| 298455300.0 | 1875.349 | 3754.599 | 840.786 |
| 298803150.0 | 1853.979 | 3738.073 | 830.53 |
| 299151000.0 | 1832.767 | 3721.62 | 820.387 |
| 299498850.0 | 1811.714 | 3705.239 | 810.357 |
| 299846700.0 | 1790.819 | 3688.929 | 800.437 |
| 300194550.0 | 1770.081 | 3672.691 | 790.628 |
| 300542400.0 | 1749.501 | 3656.523 | 780.928 |
| 300890250.0 | 1729.076 | 3640.426 | 771.335 |
| 301238100.0 | 1708.808 | 3624.4 | 761.85 |
| 301585950.0 | 1688.694 | 3608.444 | 752.471 |
| 301933800.0 | 1668.736 | 3592.557 | 743.196 |
| 302281650.0 | 1648.931 | 3576.74 | 734.025 |
| 302629500.0 | 1629.28 | 3560.992 | 724.957 |
| 302977350.0 | 1609.782 | 3545.313 | 715.991 |
| 303325200.0 | 1590.437 | 3529.703 | 707.126 |
| 303673050.0 | 1571.243 | 3514.161 | 698.36 |
| 304020900.0 | 1552.201 | 3498.686 | 689.693 |
| 304368750.0 | 1533.31 | 3483.28 | 681.124 |
| 304716600.0 | 1514.569 | 3467.94 | 672.652 |
| 305064450.0 | 1495.978 | 3452.668 | 664.276 |
| 305412300.0 | 1477.536 | 3437.462 | 655.994 |
| 305760150.0 | 1459.243 | 3422.323 | 647.807 |
| 306108000.0 | 1441.098 | 3407.251 | 639.713 |
| 306455850.0 | 1423.101 | 3392.244 | 631.71 |
| 306803700.0 | 1405.251 | 3377.302 | 623.799 |
| 307151550.0 | 1387.547 | 3362.426 | 615.979 |
| 307499400.0 | 1369.99 | 3347.615 | 608.247 |
| 307847250.0 | 1352.577 | 3332.869 | 600.604 |
| 308195100.0 | 1335.31 | 3318.187 | 593.049 |
| 308542950.0 | 1318.188 | 3303.57 | 585.58 |
| 308890800.0 | 1301.209 | 3289.016 | 578.197 |
| 309238650.0 | 1284.373 | 3274.526 | 570.899 |
| 309586500.0 | 1267.681 | 3260.1 | 563.685 |
| 309934350.0 | 1251.13 | 3245.736 | 556.554 |
| 310282200.0 | 1234.722 | 3231.435 | 549.506 |
| 310630050.0 | 1218.454 | 3217.197 | 542.539 |
| 310977900.0 | 1202.328 | 3203.021 | 535.653 |
| 311325750.0 | 1186.341 | 3188.907 | 528.847 |
| 311673600.0 | 1170.495 | 3174.854 | 522.119 |
| 312021450.0 | 1154.787 | 3160.863 | 515.47 |
| 312369300.0 | 1139.218 | 3146.934 | 508.898 |
| 312717150.0 | 1123.787 | 3133.065 | 502.403 |
| 313065000.0 | 1108.494 | 3119.257 | 495.984 |
| 313412850.0 | 1093.337 | 3105.509 | 489.639 |
| 313760700.0 | 1078.318 | 3091.821 | 483.369 |
| 314108550.0 | 1063.434 | 3078.193 | 477.173 |
| 314456400.0 | 1048.686 | 3064.625 | 471.049 |
| 314804250.0 | 1034.072 | 3051.116 | 464.997 |
| 315152100.0 | 1019.593 | 3037.666 | 459.016 |
| 315499950.0 | 1005.248 | 3024.275 | 453.106 |
| 315847800.0 | 991.037 | 3010.942 | 447.265 |
| 316195650.0 | 976.958 | 2997.668 | 441.494 |
| 316543500.0 | 963.012 | 2984.451 | 435.79 |
| 316891350.0 | 949.197 | 2971.293 | 430.154 |
| 317239200.0 | 935.514 | 2958.192 | 424.585 |
| 317587050.0 | 921.962 | 2945.148 | 419.082 |
| 317934900.0 | 908.54 | 2932.161 | 413.645 |
| 318282750.0 | 895.248 | 2919.232 | 408.272 |
| 318630600.0 | 882.085 | 2906.358 | 402.963 |
| 318978450.0 | 869.051 | 2893.541 | 397.718 |
| 319326300.0 | 856.145 | 2880.78 | 392.535 |
| 319674150.0 | 843.367 | 2868.075 | 387.414 |
| 320022000.0 | 830.717 | 2855.425 | 382.355 |
| 320369850.0 | 818.193 | 2842.831 | 377.356 |
| 320717700.0 | 805.795 | 2830.291 | 372.417 |
| 321065550.0 | 793.523 | 2817.807 | 367.538 |
| 321413400.0 | 781.376 | 2805.377 | 362.717 |
| 321761250.0 | 769.354 | 2793.001 | 357.955 |
| 322109100.0 | 757.457 | 2780.679 | 353.25 |
| 322456950.0 | 745.683 | 2768.412 | 348.602 |
| 322804800.0 | 734.032 | 2756.198 | 344.01 |
| 323152650.0 | 722.504 | 2744.037 | 339.473 |
| 323500500.0 | 711.098 | 2731.93 | 334.992 |
| 323848350.0 | 699.814 | 2719.875 | 330.565 |
| 324196200.0 | 688.652 | 2707.873 | 326.192 |
| 324544050.0 | 677.609 | 2695.924 | 321.873 |
| 324891900.0 | 666.688 | 2684.027 | 317.606 |
| 325239750.0 | 655.886 | 2672.182 | 313.391 |
| 325587600.0 | 645.203 | 2660.388 | 309.227 |
| 325935450.0 | 634.639 | 2648.647 | 305.115 |
| 326283300.0 | 624.193 | 2636.956 | 301.052 |
| 326631150.0 | 613.865 | 2625.317 | 297.04 |
| 326979000.0 | 603.654 | 2613.729 | 293.077 |
| 327326850.0 | 593.56 | 2602.191 | 289.163 |
| 327674700.0 | 583.583 | 2590.703 | 285.297 |
| 328022550.0 | 573.721 | 2579.266 | 281.478 |
| 328370400.0 | 563.975 | 2567.879 | 277.707 |
| 328718250.0 | 554.343 | 2556.542 | 273.982 |
| 329066100.0 | 544.826 | 2545.254 | 270.304 |
| 329413950.0 | 535.422 | 2534.016 | 266.671 |
| 329761800.0 | 526.132 | 2522.826 | 263.083 |
| 330109650.0 | 516.955 | 2511.686 | 259.54 |
| 330457500.0 | 507.89 | 2500.594 | 256.04 |
| 330805350.0 | 498.937 | 2489.551 | 252.585 |
| 331153200.0 | 490.096 | 2478.556 | 249.172 |
| 331501050.0 | 481.366 | 2467.61 | 245.802 |
| 331848900.0 | 472.746 | 2456.711 | 242.474 |
| 332196750.0 | 464.236 | 2445.859 | 239.188 |
| 332544600.0 | 455.835 | 2435.055 | 235.942 |
| 332892450.0 | 447.544 | 2424.299 | 232.738 |
| 333240300.0 | 439.361 | 2413.589 | 229.574 |
| 333588150.0 | 431.286 | 2402.926 | 226.449 |
| 333936000.0 | 423.319 | 2392.31 | 223.364 |
| 334283850.0 | 415.459 | 2381.74 | 220.318 |
| 334631700.0 | 407.706 | 2371.217 | 217.31 |
| 334979550.0 | 400.058 | 2360.739 | 214.341 |
| 335327400.0 | 392.517 | 2350.308 | 211.408 |
| 335675250.0 | 385.081 | 2339.921 | 208.513 |
| 336023100.0 | 377.749 | 2329.581 | 205.655 |
| 336370950.0 | 370.522 | 2319.285 | 202.833 |
| 336718800.0 | 363.399 | 2309.035 | 200.047 |
| 337066650.0 | 356.379 | 2298.829 | 197.296 |
| 337414500.0 | 349.462 | 2288.668 | 194.58 |
| 337762350.0 | 342.647 | 2278.551 | 191.899 |
| 338110200.0 | 335.934 | 2268.479 | 189.252 |
| 338458050.0 | 329.323 | 2258.45 | 186.639 |
| 338805900.0 | 322.813 | 2248.466 | 184.06 |
| 339153750.0 | 316.403 | 2238.525 | 181.513 |
| 339501600.0 | 310.094 | 2228.628 | 178.999 |
| 339849450.0 | 303.884 | 2218.773 | 176.518 |
| 340197300.0 | 297.773 | 2208.962 | 174.068 |
| 340545150.0 | 291.761 | 2199.194 | 171.65 |
| 340893000.0 | 285.847 | 2189.469 | 169.263 |
| 341240850.0 | 280.031 | 2179.786 | 166.907 |
| 341588700.0 | 274.312 | 2170.145 | 164.581 |
| 341936550.0 | 268.691 | 2160.546 | 162.286 |
| 342284400.0 | 263.165 | 2150.99 | 160.02 |
| 342632250.0 | 257.736 | 2141.475 | 157.783 |
| 342980100.0 | 252.402 | 2132.002 | 155.576 |
| 343327950.0 | 247.163 | 2122.57 | 153.397 |
| 343675800.0 | 242.019 | 2113.18 | 151.247 |
| 344023650.0 | 236.968 | 2103.83 | 149.124 |
| 344371500.0 | 232.012 | 2094.522 | 147.03 |
| 344719350.0 | 227.149 | 2085.254 | 144.962 |
| 345067200.0 | 222.378 | 2076.027 | 142.922 |
| 345415050.0 | 217.7 | 2066.84 | 140.908 |
| 345762900.0 | 213.114 | 2057.693 | 138.921 |
| 346110750.0 | 208.619 | 2048.586 | 136.96 |
| 346458600.0 | 204.215 | 2039.519 | 135.025 |
| 346806450.0 | 199.901 | 2030.491 | 133.115 |
| 347154300.0 | 195.678 | 2021.503 | 131.23 |
| 347502150.0 | 191.544 | 2012.555 | 129.37 |
| 347850000.0 | 187.5 | 2003.645 | 127.534 |
| 348197850.0 | 183.544 | 1994.775 | 125.723 |
| 348545700.0 | 179.677 | 1985.943 | 123.936 |
| 348893550.0 | 175.897 | 1977.15 | 122.172 |
| 349241400.0 | 172.205 | 1968.395 | 120.432 |
| 349589250.0 | 168.6 | 1959.678 | 118.715 |
| 349937100.0 | 165.082 | 1951 | 117.021 |
| 350284950.0 | 161.649 | 1942.36 | 115.349 |
| 350632800.0 | 158.302 | 1933.757 | 113.699 |
| 350980650.0 | 155.041 | 1925.192 | 112.072 |
| 351328500.0 | 151.864 | 1916.664 | 110.466 |
| 351676350.0 | 148.771 | 1908.174 | 108.881 |
| 352024200.0 | 145.763 | 1899.721 | 107.318 |
| 352372050.0 | 142.838 | 1891.305 | 105.776 |
| 352719900.0 | 139.996 | 1882.925 | 104.254 |
| 353067750.0 | 137.236 | 1874.582 | 102.753 |
| 353415600.0 | 134.559 | 1866.276 | 101.272 |
| 353763450.0 | 131.964 | 1858.006 | 99.811 |
| 354111300.0 | 129.449 | 1849.772 | 98.37 |
| 354459150.0 | 127.016 | 1841.574 | 96.948 |
| 354807000.0 | 124.663 | 1833.412 | 95.545 |
| 355154850.0 | 122.39 | 1825.286 | 94.161 |
| 355502700.0 | 120.197 | 1817.195 | 92.796 |
| 355850550.0 | 118.083 | 1809.14 | 91.449 |
| 356198400.0 | 116.048 | 1801.119 | 90.121 |
| 356546250.0 | 114.091 | 1793.134 | 88.811 |
| 356894100.0 | 112.212 | 1785.184 | 87.518 |
| 357241950.0 | 110.41 | 1777.268 | 86.243 |
| 357589800.0 | 108.685 | 1769.388 | 84.986 |
| 357937650.0 | 107.038 | 1761.541 | 83.745 |
| 358285500.0 | 105.466 | 1753.729 | 82.522 |
| 358633350.0 | 103.97 | 1745.951 | 81.315 |
| 358981200.0 | 102.549 | 1738.207 | 80.124 |
| 359329050.0 | 101.204 | 1730.497 | 78.95 |
| 359676900.0 | 99.932 | 1722.82 | 77.792 |
| 360024750.0 | 98.735 | 1715.178 | 76.65 |
| 360372600.0 | 97.612 | 1707.568 | 75.524 |
| 360720450.0 | 96.562 | 1699.992 | 74.413 |
| 361068300.0 | 95.585 | 1692.449 | 73.318 |
| 361416150.0 | 94.68 | 1684.939 | 72.237 |
| 361764000.0 | 93.847 | 1677.462 | 71.171 |
| 362111850.0 | 93.086 | 1670.017 | 70.121 |
| 362459700.0 | 92.396 | 1662.605 | 69.084 |
| 362807550.0 | 91.777 | 1655.225 | 68.062 |
| 363155400.0 | 91.228 | 1647.878 | 67.054 |
| 363503250.0 | 90.749 | 1640.563 | 66.061 |
| 363851100.0 | 90.34 | 1633.28 | 65.081 |
| 364198950.0 | 90 | 1626.028 | 64.114 |
| 364546800.0 | 89.728 | 1618.809 | 63.161 |
| 364894650.0 | 89.525 | 1611.62 | 62.221 |
| 365242500.0 | 89.39 | 1604.464 | 61.295 |
| 365590350.0 | 89.323 | 1597.338 | 60.381 |
| 365938200.0 | 89.322 | 1590.244 | 59.48 |
| 366286050.0 | 89.388 | 1583.181 | 58.592 |
| 366633900.0 | 89.521 | 1576.148 | 57.716 |
| 366981750.0 | 89.719 | 1569.147 | 56.852 |
| 367329600.0 | 89.983 | 1562.176 | 56.001 |
| 367677450.0 | 90.313 | 1555.235 | 55.162 |
| 368025300.0 | 90.706 | 1548.325 | 54.334 |
| 368373150.0 | 91.164 | 1541.445 | 53.518 |
| 368721000.0 | 91.686 | 1534.595 | 52.713 |
| 369068850.0 | 92.272 | 1527.775 | 51.92 |
| 369416700.0 | 92.921 | 1520.985 | 51.138 |
| 369764550.0 | 93.632 | 1514.225 | 50.367 |
| 370112400.0 | 94.406 | 1507.494 | 49.607 |
| 370460250.0 | 95.241 | 1500.792 | 48.858 |
| 370808100.0 | 96.138 | 1494.12 | 48.119 |
| 371155950.0 | 97.097 | 1487.477 | 47.391 |
| 371503800.0 | 98.116 | 1480.863 | 46.674 |
| 371851650.0 | 99.195 | 1474.278 | 45.966 |
| 372199500.0 | 100.334 | 1467.722 | 45.268 |
| 372547350.0 | 101.533 | 1461.194 | 44.581 |
| 372895200.0 | 102.791 | 1454.695 | 43.903 |
| 373243050.0 | 104.108 | 1448.224 | 43.235 |
| 373590900.0 | 105.484 | 1441.782 | 42.577 |
| 373938750.0 | 106.917 | 1435.368 | 41.928 |
| 374286600.0 | 108.408 | 1428.982 | 41.288 |
| 374634450.0 | 109.956 | 1422.623 | 40.657 |
| 374982300.0 | 111.561 | 1416.293 | 40.036 |
| 375330150.0 | 113.223 | 1409.99 | 39.423 |
| 375678000.0 | 114.941 | 1403.715 | 38.82 |
| 376025850.0 | 116.714 | 1397.467 | 38.225 |
| 376373700.0 | 118.543 | 1391.247 | 37.638 |
| 376721550.0 | 120.427 | 1385.053 | 37.06 |
| 377069400.0 | 122.365 | 1378.887 | 36.49 |
| 377417250.0 | 124.357 | 1372.748 | 35.929 |
| 377765100.0 | 126.404 | 1366.636 | 35.376 |
| 378112950.0 | 128.503 | 1360.55 | 34.831 |
| 378460800.0 | 130.656 | 1354.491 | 34.293 |
| 378808650.0 | 132.862 | 1348.458 | 33.764 |
| 379156500.0 | 135.12 | 1342.452 | 33.242 |
| 379504350.0 | 137.43 | 1336.472 | 32.728 |
| 379852200.0 | 139.791 | 1330.518 | 32.221 |
| 380200050.0 | 142.203 | 1324.591 | 31.722 |
| 380547900.0 | 144.667 | 1318.689 | 31.229 |
| 380895750.0 | 147.181 | 1312.813 | 30.745 |
| 381243600.0 | 149.745 | 1306.962 | 30.267 |
| 381591450.0 | 152.358 | 1301.138 | 29.796 |
| 381939300.0 | 155.021 | 1295.338 | 29.332 |
| 382287150.0 | 157.733 | 1289.564 | 28.875 |
| 382635000.0 | 160.494 | 1283.816 | 28.425 |
| 382982850.0 | 163.303 | 1278.092 | 27.981 |
| 383330700.0 | 166.159 | 1272.393 | 27.544 |
| 383678550.0 | 169.063 | 1266.72 | 27.113 |
| 384026400.0 | 172.015 | 1261.071 | 26.689 |
| 384374250.0 | 175.013 | 1255.447 | 26.271 |
| 384722100.0 | 178.057 | 1249.847 | 25.859 |
| 385069950.0 | 181.148 | 1244.272 | 25.453 |
| 385417800.0 | 184.284 | 1238.721 | 25.053 |
| 385765650.0 | 187.466 | 1233.195 | 24.659 |
| 386113500.0 | 190.693 | 1227.693 | 24.271 |
| 386461350.0 | 193.964 | 1222.214 | 23.889 |
| 386809200.0 | 197.279 | 1216.76 | 23.512 |
| 387157050.0 | 200.639 | 1211.33 | 23.141 |
| 387504900.0 | 204.042 | 1205.923 | 22.776 |
| 387852750.0 | 207.488 | 1200.54 | 22.416 |
| 388200600.0 | 210.977 | 1195.18 | 22.061 |
| 388548450.0 | 214.508 | 1189.844 | 21.712 |
| 388896300.0 | 218.082 | 1184.531 | 21.368 |
| 389244150.0 | 221.697 | 1179.242 | 21.029 |
| 389592000.0 | 225.354 | 1173.976 | 20.695 |
| 389939850.0 | 229.052 | 1168.732 | 20.366 |
| 390287700.0 | 232.791 | 1163.512 | 20.042 |
| 390635550.0 | 236.57 | 1158.314 | 19.723 |
| 390983400.0 | 240.389 | 1153.139 | 19.409 |
| 391331250.0 | 244.247 | 1147.987 | 19.099 |
| 391679100.0 | 248.145 | 1142.857 | 18.794 |
| 392026950.0 | 252.082 | 1137.75 | 18.494 |
| 392374800.0 | 256.058 | 1132.665 | 18.198 |
| 392722650.0 | 260.072 | 1127.602 | 17.907 |
| 393070500.0 | 264.124 | 1122.561 | 17.62 |
| 393418350.0 | 268.213 | 1117.543 | 17.338 |
| 393766200.0 | 272.34 | 1112.546 | 17.06 |
| 394114050.0 | 276.504 | 1107.571 | 16.786 |
| 394461900.0 | 280.704 | 1102.618 | 16.516 |
| 394809750.0 | 284.941 | 1097.687 | 16.25 |
| 395157600.0 | 289.213 | 1092.777 | 15.988 |
| 395505450.0 | 293.521 | 1087.888 | 15.731 |
| 395853300.0 | 297.864 | 1083.021 | 15.477 |
| 396201150.0 | 302.243 | 1078.176 | 15.227 |
| 396549000.0 | 306.655 | 1073.351 | 14.981 |
| 396896850.0 | 311.102 | 1068.548 | 14.739 |
| 397244700.0 | 315.583 | 1063.765 | 14.5 |
| 397592550.0 | 320.097 | 1059.003 | 14.265 |
| 397940400.0 | 324.645 | 1054.263 | 14.034 |
| 398288250.0 | 329.225 | 1049.543 | 13.806 |
| 398636100.0 | 333.838 | 1044.843 | 13.582 |
| 398983950.0 | 338.483 | 1040.164 | 13.361 |
| 399331800.0 | 343.16 | 1035.506 | 13.144 |
| 399679650.0 | 347.869 | 1030.868 | 12.93 |
| 400027500.0 | 352.609 | 1026.25 | 12.719 |
| 400375350.0 | 357.38 | 1021.653 | 12.511 |
| 400723200.0 | 362.181 | 1017.075 | 12.307 |
| 401071050.0 | 367.013 | 1012.518 | 12.106 |
| 401418900.0 | 371.874 | 1007.98 | 11.908 |
| 401766750.0 | 376.766 | 1003.463 | 11.713 |
| 402114600.0 | 381.686 | 998.965 | 11.521 |
| 402462450.0 | 386.635 | 994.486 | 11.332 |
| 402810300.0 | 391.614 | 990.028 | 11.146 |
| 403158150.0 | 396.62 | 985.589 | 10.963 |
| 403506000.0 | 401.654 | 981.169 | 10.783 |
| 403853850.0 | 406.716 | 976.768 | 10.606 |
| 404201700.0 | 411.806 | 972.387 | 10.431 |
| 404549550.0 | 416.922 | 968.025 | 10.259 |
| 404897400.0 | 422.065 | 963.682 | 10.09 |
| 405245250.0 | 427.235 | 959.358 | 9.923 |
| 405593100.0 | 432.43 | 955.053 | 9.759 |
| 405940950.0 | 437.652 | 950.767 | 9.598 |
| 406288800.0 | 442.899 | 946.499 | 9.439 |
| 406636650.0 | 448.171 | 942.25 | 9.283 |
| 406984500.0 | 453.468 | 938.02 | 9.129 |
| 407332350.0 | 458.789 | 933.808 | 8.977 |
| 407680200.0 | 464.135 | 929.615 | 8.828 |
| 408028050.0 | 469.504 | 925.439 | 8.681 |
| 408375900.0 | 474.897 | 921.283 | 8.537 |
| 408723750.0 | 480.313 | 917.144 | 8.395 |
| 409071600.0 | 485.753 | 913.023 | 8.255 |
| 409419450.0 | 491.215 | 908.921 | 8.117 |
| 409767300.0 | 496.699 | 904.836 | 7.982 |
| 410115150.0 | 502.205 | 900.769 | 7.848 |
| 410463000.0 | 507.734 | 896.721 | 7.717 |
| 410810850.0 | 513.283 | 892.689 | 7.588 |
| 411158700.0 | 518.854 | 888.676 | 7.461 |
| 411506550.0 | 524.445 | 884.679 | 7.336 |
| 411854400.0 | 530.057 | 880.701 | 7.213 |
| 412202250.0 | 535.69 | 876.74 | 7.092 |
| 412550100.0 | 541.342 | 872.796 | 6.972 |
| 412897950.0 | 547.014 | 868.869 | 6.855 |
| 413245800.0 | 552.705 | 864.96 | 6.74 |
| 413593650.0 | 558.415 | 861.067 | 6.626 |
| 413941500.0 | 564.144 | 857.192 | 6.514 |
| 414289350.0 | 569.892 | 853.333 | 6.404 |
| 414637200.0 | 575.657 | 849.492 | 6.296 |
| 414985050.0 | 581.441 | 845.667 | 6.19 |
| 415332900.0 | 587.242 | 841.859 | 6.085 |
| 415680750.0 | 593.06 | 838.067 | 5.982 |
| 416028600.0 | 598.895 | 834.292 | 5.881 |
| 416376450.0 | 604.747 | 830.534 | 5.781 |
| 416724300.0 | 610.615 | 826.792 | 5.683 |
| 417072150.0 | 616.5 | 823.067 | 5.586 |
| 417420000.0 | 622.4 | 819.357 | 5.491 |
| 417767850.0 | 628.316 | 815.664 | 5.398 |
| 418115700.0 | 634.247 | 811.987 | 5.306 |
| 418463550.0 | 640.193 | 808.327 | 5.216 |
| 418811400.0 | 646.153 | 804.682 | 5.127 |
| 419159250.0 | 652.128 | 801.053 | 5.039 |
| 419507100.0 | 658.117 | 797.44 | 4.953 |
| 419854950.0 | 664.12 | 793.843 | 4.868 |
| 420202800.0 | 670.136 | 790.261 | 4.785 |
| 420550650.0 | 676.166 | 786.695 | 4.703 |
| 420898500.0 | 682.208 | 783.145 | 4.622 |
| 421246350.0 | 688.263 | 779.61 | 4.543 |
| 421594200.0 | 694.331 | 776.091 | 4.465 |
| 421942050.0 | 700.411 | 772.587 | 4.388 |
| 422289900.0 | 706.502 | 769.098 | 4.313 |
| 422637750.0 | 712.605 | 765.625 | 4.239 |
| 422985600.0 | 718.72 | 762.167 | 4.166 |
| 423333450.0 | 724.845 | 758.724 | 4.094 |
| 423681300.0 | 730.981 | 755.296 | 4.023 |
| 424029150.0 | 737.128 | 751.883 | 3.954 |
| 424377000.0 | 743.285 | 748.485 | 3.885 |
| 424724850.0 | 749.451 | 745.102 | 3.818 |
| 425072700.0 | 755.628 | 741.733 | 3.752 |
| 425420550.0 | 761.813 | 738.38 | 3.687 |
| 425768400.0 | 768.008 | 735.041 | 3.623 |
| 426116250.0 | 774.212 | 731.716 | 3.56 |
| 426464100.0 | 780.424 | 728.406 | 3.498 |
| 426811950.0 | 786.645 | 725.111 | 3.438 |
| 427159800.0 | 792.873 | 721.83 | 3.378 |
| 427507650.0 | 799.109 | 718.563 | 3.319 |
| 427855500.0 | 805.353 | 715.311 | 3.261 |
| 428203350.0 | 811.604 | 712.073 | 3.204 |
| 428551200.0 | 817.862 | 708.849 | 3.148 |
| 428899050.0 | 824.126 | 705.639 | 3.093 |
| 429246900.0 | 830.397 | 702.443 | 3.039 |
| 429594750.0 | 836.675 | 699.261 | 2.986 |
| 429942600.0 | 842.958 | 696.093 | 2.934 |
| 430290450.0 | 849.246 | 692.939 | 2.882 |
| 430638300.0 | 855.54 | 689.798 | 2.832 |
| 430986150.0 | 861.84 | 686.672 | 2.782 |
| 431334000.0 | 868.144 | 683.559 | 2.733 |
| 431681850.0 | 874.453 | 680.459 | 2.685 |
| 432029700.0 | 880.766 | 677.373 | 2.638 |
| 432377550.0 | 887.083 | 674.301 | 2.592 |
| 432725400.0 | 893.404 | 671.242 | 2.546 |
| 433073250.0 | 899.728 | 668.197 | 2.501 |
| 433421100.0 | 906.056 | 665.165 | 2.457 |
| 433768950.0 | 912.387 | 662.146 | 2.413 |
| 434116800.0 | 918.721 | 659.14 | 2.371 |
| 434464650.0 | 925.058 | 656.147 | 2.329 |
| 434812500.0 | 931.396 | 653.168 | 2.288 |
| 435160350.0 | 937.737 | 650.201 | 2.247 |
| 435508200.0 | 944.08 | 647.248 | 2.207 |
| 435856050.0 | 950.424 | 644.307 | 2.168 |
| 436203900.0 | 956.77 | 641.379 | 2.13 |
| 436551750.0 | 963.117 | 638.464 | 2.092 |
| 436899600.0 | 969.464 | 635.562 | 2.055 |
| 437247450.0 | 975.812 | 632.673 | 2.018 |
| 437595300.0 | 982.161 | 629.796 | 1.982 |
| 437943150.0 | 988.509 | 626.931 | 1.947 |
| 438291000.0 | 994.858 | 624.08 | 1.912 |
| 438638850.0 | 1001.206 | 621.24 | 1.878 |
| 438986700.0 | 1007.553 | 618.413 | 1.844 |
| 439334550.0 | 1013.9 | 615.599 | 1.811 |
| 439682400.0 | 1020.245 | 612.797 | 1.779 |
| 440030250.0 | 1026.589 | 610.007 | 1.747 |
| 440378100.0 | 1032.932 | 607.229 | 1.716 |
| 440725950.0 | 1039.273 | 604.463 | 1.685 |
| 441073800.0 | 1045.611 | 601.71 | 1.655 |
| 441421650.0 | 1051.948 | 598.968 | 1.625 |
| 441769500.0 | 1058.282 | 596.238 | 1.596 |
| 442117350.0 | 1064.613 | 593.521 | 1.567 |
| 442465200.0 | 1070.941 | 590.815 | 1.539 |
| 442813050.0 | 1077.266 | 588.121 | 1.511 |
| 443160900.0 | 1083.587 | 585.439 | 1.484 |
| 443508750.0 | 1089.905 | 582.769 | 1.457 |
| 443856600.0 | 1096.219 | 580.11 | 1.431 |
| 444204450.0 | 1102.529 | 577.463 | 1.405 |
| 444552300.0 | 1108.834 | 574.827 | 1.379 |
| 444900150.0 | 1115.135 | 572.203 | 1.354 |
| 445248000.0 | 1121.431 | 569.591 | 1.33 |
| 445595850.0 | 1127.722 | 566.99 | 1.306 |
| 445943700.0 | 1134.008 | 564.4 | 1.282 |
| 446291550.0 | 1140.288 | 561.822 | 1.259 |
| 446639400.0 | 1146.562 | 559.254 | 1.236 |
| 446987250.0 | 1152.831 | 556.698 | 1.213 |
| 447335100.0 | 1159.093 | 554.154 | 1.191 |
| 447682950.0 | 1165.349 | 551.62 | 1.169 |
| 448030800.0 | 1171.598 | 549.098 | 1.148 |
| 448378650.0 | 1177.84 | 546.586 | 1.127 |
| 448726500.0 | 1184.076 | 544.085 | 1.107 |
| 449074350.0 | 1190.304 | 541.596 | 1.086 |
| 449422200.0 | 1196.524 | 539.117 | 1.066 |
| 449770050.0 | 1202.737 | 536.649 | 1.047 |
| 450117900.0 | 1208.942 | 534.192 | 1.028 |
| 450465750.0 | 1215.139 | 531.746 | 1.009 |
| 450813600.0 | 1221.328 | 529.31 | 0.99 |
| 451161450.0 | 1227.508 | 526.885 | 0.972 |
| 451509300.0 | 1233.679 | 524.471 | 0.954 |
| 451857150.0 | 1239.841 | 522.067 | 0.937 |
| 452205000.0 | 1245.994 | 519.674 | 0.92 |
| 452552850.0 | 1252.137 | 517.291 | 0.903 |
| 452900700.0 | 1258.271 | 514.918 | 0.886 |
| 453248550.0 | 1264.395 | 512.556 | 0.87 |
| 453596400.0 | 1270.509 | 510.204 | 0.854 |
| 453944250.0 | 1276.613 | 507.863 | 0.838 |
| 454292100.0 | 1282.706 | 505.532 | 0.822 |
| 454639950.0 | 1288.789 | 503.211 | 0.807 |
| 454987800.0 | 1294.861 | 500.9 | 0.792 |
| 455335650.0 | 1300.921 | 498.599 | 0.777 |
| 455683500.0 | 1306.971 | 496.308 | 0.763 |
| 456031350.0 | 1313.009 | 494.027 | 0.749 |
| 456379200.0 | 1319.035 | 491.757 | 0.735 |
| 456727050.0 | 1325.049 | 489.496 | 0.721 |
| 457074900.0 | 1331.051 | 487.245 | 0.708 |
| 457422750.0 | 1337.041 | 485.004 | 0.695 |
| 457770600.0 | 1343.019 | 482.772 | 0.682 |
| 458118450.0 | 1348.984 | 480.551 | 0.669 |
| 458466300.0 | 1354.935 | 478.339 | 0.657 |
| 458814150.0 | 1360.874 | 476.137 | 0.644 |
| 459162000.0 | 1366.8 | 473.944 | 0.632 |
| 459509850.0 | 1372.712 | 471.761 | 0.62 |
| 459857700.0 | 1378.61 | 469.588 | 0.609 |
| 460205550.0 | 1384.495 | 467.424 | 0.597 |
| 460553400.0 | 1390.365 | 465.27 | 0.586 |
| 460901250.0 | 1396.222 | 463.124 | 0.575 |
| 461249100.0 | 1402.063 | 460.989 | 0.564 |
| 461596950.0 | 1407.891 | 458.862 | 0.554 |
| 461944800.0 | 1413.703 | 456.745 | 0.543 |
| 462292650.0 | 1419.5 | 454.638 | 0.533 |
| 462640500.0 | 1425.283 | 452.539 | 0.523 |
| 462988350.0 | 1431.049 | 450.45 | 0.513 |
| 463336200.0 | 1436.801 | 448.37 | 0.504 |
| 463684050.0 | 1442.536 | 446.298 | 0.494 |
| 464031900.0 | 1448.256 | 444.236 | 0.485 |
| 464379750.0 | 1453.959 | 442.183 | 0.476 |
| 464727600.0 | 1459.646 | 440.139 | 0.467 |
| 465075450.0 | 1465.317 | 438.104 | 0.458 |
| 465423300.0 | 1470.971 | 436.078 | 0.449 |
| 465771150.0 | 1476.608 | 434.06 | 0.441 |
| 466119000.0 | 1482.228 | 432.052 | 0.432 |
| 466466850.0 | 1487.831 | 430.052 | 0.424 |
| 466814700.0 | 1493.416 | 428.061 | 0.416 |
| 467162550.0 | 1498.984 | 426.078 | 0.408 |
| 467510400.0 | 1504.534 | 424.105 | 0.4 |
| 467858250.0 | 1510.067 | 422.14 | 0.393 |
| 468206100.0 | 1515.581 | 420.183 | 0.385 |
| 468553950.0 | 1521.077 | 418.235 | 0.378 |
| 468901800.0 | 1526.554 | 416.296 | 0.371 |
| 469249650.0 | 1532.013 | 414.365 | 0.364 |
| 469597500.0 | 1537.453 | 412.442 | 0.357 |
| 469945350.0 | 1542.874 | 410.528 | 0.35 |
| 470293200.0 | 1548.276 | 408.623 | 0.343 |
| 470641050.0 | 1553.658 | 406.725 | 0.337 |
| 470988900.0 | 1559.021 | 404.836 | 0.33 |
| 471336750.0 | 1564.365 | 402.955 | 0.324 |
| 471684600.0 | 1569.688 | 401.083 | 0.318 |
| 472032450.0 | 1574.992 | 399.218 | 0.311 |
| 472380300.0 | 1580.276 | 397.362 | 0.305 |
| 472728150.0 | 1585.539 | 395.514 | 0.3 |
| 473076000.0 | 1590.781 | 393.674 | 0.294 |
| 473423850.0 | 1596.004 | 391.842 | 0.288 |
| 473771700.0 | 1601.205 | 390.018 | 0.283 |
| 474119550.0 | 1606.385 | 388.202 | 0.277 |
| 474467400.0 | 1611.544 | 386.394 | 0.272 |
| 474815250.0 | 1616.682 | 384.593 | 0.267 |
| 475163100.0 | 1621.799 | 382.801 | 0.261 |
| 475510950.0 | 1626.893 | 381.017 | 0.256 |
| 475858800.0 | 1631.966 | 379.24 | 0.251 |
| 476206650.0 | 1637.017 | 377.471 | 0.247 |
| 476554500.0 | 1642.046 | 375.71 | 0.242 |
| 476902350.0 | 1647.053 | 373.956 | 0.237 |
| 477250200.0 | 1652.038 | 372.21 | 0.232 |
| 477598050.0 | 1656.999 | 370.472 | 0.228 |
| 477945900.0 | 1661.939 | 368.742 | 0.224 |
| 478293750.0 | 1666.855 | 367.019 | 0.219 |
| 478641600.0 | 1671.748 | 365.303 | 0.215 |
| 478989450.0 | 1676.618 | 363.595 | 0.211 |
| 479337300.0 | 1681.465 | 361.895 | 0.207 |
| 479685150.0 | 1686.288 | 360.201 | 0.203 |
| 480033000.0 | 1691.088 | 358.516 | 0.199 |
| 480380850.0 | 1695.864 | 356.837 | 0.195 |
| 480728700.0 | 1700.616 | 355.166 | 0.191 |
| 481076550.0 | 1705.344 | 353.503 | 0.187 |
| 481424400.0 | 1710.048 | 351.846 | 0.184 |
| 481772250.0 | 1714.727 | 350.197 | 0.18 |
| 482120100.0 | 1719.382 | 348.555 | 0.176 |
| 482467950.0 | 1724.012 | 346.92 | 0.173 |
| 482815800.0 | 1728.618 | 345.293 | 0.17 |
| 483163650.0 | 1733.198 | 343.672 | 0.166 |
| 483511500.0 | 1737.754 | 342.059 | 0.163 |
| 483859350.0 | 1742.284 | 340.452 | 0.16 |
| 484207200.0 | 1746.789 | 338.853 | 0.157 |
| 484555050.0 | 1751.269 | 337.261 | 0.153 |
| 484902900.0 | 1755.723 | 335.675 | 0.15 |
| 485250750.0 | 1760.151 | 334.097 | 0.147 |
| 485598600.0 | 1764.553 | 332.525 | 0.145 |
| 485946450.0 | 1768.929 | 330.961 | 0.142 |
| 486294300.0 | 1773.279 | 329.403 | 0.139 |
| 486642150.0 | 1777.603 | 327.852 | 0.136 |
| 486990000.0 | 1781.9 | 326.307 | 0.133 |
| 487337850.0 | 1786.171 | 324.77 | 0.131 |
| 487685700.0 | 1790.415 | 323.239 | 0.128 |
| 488033550.0 | 1794.632 | 321.715 | 0.126 |
| 488381400.0 | 1798.822 | 320.198 | 0.123 |
| 488729250.0 | 1802.985 | 318.687 | 0.121 |
| 489077100.0 | 1807.121 | 317.183 | 0.118 |
| 489424950.0 | 1811.23 | 315.685 | 0.116 |
| 489772800.0 | 1815.311 | 314.194 | 0.114 |
| 490120650.0 | 1819.364 | 312.709 | 0.111 |
| 490468500.0 | 1823.39 | 311.231 | 0.109 |
| 490816350.0 | 1827.388 | 309.76 | 0.107 |
| 491164200.0 | 1831.357 | 308.295 | 0.105 |
| 491512050.0 | 1835.299 | 306.836 | 0.103 |
| 491859900.0 | 1839.213 | 305.383 | 0.101 |
| 492207750.0 | 1843.098 | 303.937 | 0.099 |
| 492555600.0 | 1846.955 | 302.498 | 0.097 |
| 492903450.0 | 1850.783 | 301.064 | 0.095 |
| 493251300.0 | 1854.582 | 299.637 | 0.093 |
| 493599150.0 | 1858.353 | 298.216 | 0.091 |
| 493947000.0 | 1862.094 | 296.801 | 0.089 |
| 494294850.0 | 1865.807 | 295.393 | 0.087 |
| 494642700.0 | 1869.49 | 293.991 | 0.086 |
| 494990550.0 | 1873.144 | 292.594 | 0.084 |
| 495338400.0 | 1876.769 | 291.204 | 0.082 |
| 495686250.0 | 1880.364 | 289.82 | 0.081 |
| 496034100.0 | 1883.93 | 288.442 | 0.079 |
| 496381950.0 | 1887.465 | 287.07 | 0.077 |
| 496729800.0 | 1890.971 | 285.704 | 0.076 |
| 497077650.0 | 1894.447 | 284.344 | 0.074 |
| 497425500.0 | 1897.893 | 282.99 | 0.073 |
| 497773350.0 | 1901.309 | 281.642 | 0.071 |
| 498121200.0 | 1904.694 | 280.3 | 0.07 |
| 498469050.0 | 1908.049 | 278.963 | 0.068 |
| 498816900.0 | 1911.373 | 277.633 | 0.067 |
| 499164750.0 | 1914.667 | 276.308 | 0.066 |
| 499512600.0 | 1917.93 | 274.989 | 0.064 |
| 499860450.0 | 1921.162 | 273.676 | 0.063 |
| 500208300.0 | 1924.363 | 272.369 | 0.062 |
| 500556150.0 | 1927.534 | 271.067 | 0.06 |
| 500904000.0 | 1930.673 | 269.771 | 0.059 |
| 501251850.0 | 1933.78 | 268.481 | 0.058 |
| 501599700.0 | 1936.857 | 267.196 | 0.057 |
| 501947550.0 | 1939.902 | 265.917 | 0.056 |
| 502295400.0 | 1942.915 | 264.643 | 0.055 |
| 502643250.0 | 1945.897 | 263.375 | 0.053 |
| 502991100.0 | 1948.847 | 262.113 | 0.052 |
| 503338950.0 | 1951.765 | 260.856 | 0.051 |
| 503686800.0 | 1954.651 | 259.605 | 0.05 |
| 504034650.0 | 1957.506 | 258.359 | 0.049 |
| 504382500.0 | 1960.328 | 257.118 | 0.048 |
| 504730350.0 | 1963.118 | 255.883 | 0.047 |
| 505078200.0 | 1965.875 | 254.654 | 0.046 |
| 505426050.0 | 1968.6 | 253.429 | 0.045 |
| 505773900.0 | 1971.293 | 252.211 | 0.044 |
| 506121750.0 | 1973.953 | 250.997 | 0.043 |
| 506469600.0 | 1976.58 | 249.789 | 0.043 |
| 506817450.0 | 1979.175 | 248.586 | 0.042 |
| 507165300.0 | 1981.736 | 247.388 | 0.041 |
| 507513150.0 | 1984.265 | 246.196 | 0.04 |
| 507861000.0 | 1986.761 | 245.008 | 0.039 |
| 508208850.0 | 1989.223 | 243.826 | 0.038 |
| 508556700.0 | 1991.653 | 242.649 | 0.038 |
| 508904550.0 | 1994.049 | 241.477 | 0.037 |
| 509252400.0 | 1996.411 | 240.311 | 0.036 |
| 509600250.0 | 1998.741 | 239.149 | 0.035 |
| 509948100.0 | 2001.036 | 237.993 | 0.035 |
| 510295950.0 | 2003.298 | 236.841 | 0.034 |
| 510643800.0 | 2005.527 | 235.695 | 0.033 |
| 510991650.0 | 2007.721 | 234.554 | 0.032 |
| 511339500.0 | 2009.882 | 233.417 | 0.032 |
| 511687350.0 | 2012.009 | 232.286 | 0.031 |
| 512035200.0 | 2014.101 | 231.159 | 0.03 |
| 512383050.0 | 2016.16 | 230.038 | 0.03 |
| 512730900.0 | 2018.185 | 228.921 | 0.029 |
| 513078750.0 | 2020.175 | 227.809 | 0.029 |
| 513426600.0 | 2022.131 | 226.703 | 0.028 |
| 513774450.0 | 2024.052 | 225.6 | 0.027 |
| 514122300.0 | 2025.939 | 224.503 | 0.027 |
| 514470150.0 | 2027.792 | 223.411 | 0.026 |
| 514818000.0 | 2029.609 | 222.323 | 0.026 |
| 515165850.0 | 2031.393 | 221.24 | 0.025 |
| 515513700.0 | 2033.141 | 220.162 | 0.025 |
| 515861550.0 | 2034.855 | 219.089 | 0.024 |
| 516209400.0 | 2036.533 | 218.02 | 0.024 |
| 516557250.0 | 2038.177 | 216.956 | 0.023 |
| 516905100.0 | 2039.786 | 215.896 | 0.023 |
| 517252950.0 | 2041.359 | 214.841 | 0.022 |
| 517600800.0 | 2042.898 | 213.791 | 0.022 |
| 517948650.0 | 2044.401 | 212.746 | 0.021 |
| 518296500.0 | 2045.869 | 211.705 | 0.021 |
| 518644350.0 | 2047.301 | 210.668 | 0.02 |
| 518992200.0 | 2048.699 | 209.636 | 0.02 |
| 519340050.0 | 2050.06 | 208.609 | 0.02 |
| 519687900.0 | 2051.386 | 207.586 | 0.019 |
| 520035750.0 | 2052.677 | 206.567 | 0.019 |
| 520383600.0 | 2053.932 | 205.553 | 0.018 |
| 520731450.0 | 2055.151 | 204.544 | 0.018 |
| 521079300.0 | 2056.334 | 203.538 | 0.018 |
| 521427150.0 | 2057.482 | 202.538 | 0.017 |
| 521775000.0 | 2058.594 | 201.541 | 0.017 |
| 522122850.0 | 2059.67 | 200.549 | 0.016 |
| 522470700.0 | 2060.709 | 199.561 | 0.016 |
| 522818550.0 | 2061.713 | 198.578 | 0.016 |
| 523166400.0 | 2062.681 | 197.599 | 0.015 |
| 523514250.0 | 2063.612 | 196.624 | 0.015 |
| 523862100.0 | 2064.507 | 195.654 | 0.015 |
| 524209950.0 | 2065.366 | 194.687 | 0.014 |
| 524557800.0 | 2066.189 | 193.725 | 0.014 |
| 524905650.0 | 2066.976 | 192.767 | 0.014 |
| 525253500.0 | 2067.726 | 191.814 | 0.014 |
| 525601350.0 | 2068.439 | 190.864 | 0.013 |
| 525949200.0 | 2069.116 | 189.919 | 0.013 |
| 526297050.0 | 2069.757 | 188.977 | 0.013 |
| 526644900.0 | 2070.361 | 188.04 | 0.012 |
| 526992750.0 | 2070.928 | 187.107 | 0.012 |
| 527340600.0 | 2071.458 | 186.178 | 0.012 |
| 527688450.0 | 2071.952 | 185.253 | 0.012 |
| 528036300.0 | 2072.41 | 184.333 | 0.011 |
| 528384150.0 | 2072.83 | 183.416 | 0.011 |
| 528732000.0 | 2073.213 | 182.503 | 0.011 |
| 529079850.0 | 2073.56 | 181.594 | 0.011 |
| 529427700.0 | 2073.87 | 180.689 | 0.01 |
| 529775550.0 | 2074.143 | 179.788 | 0.01 |
| 530123400.0 | 2074.378 | 178.891 | 0.01 |
| 530471250.0 | 2074.577 | 177.998 | 0.01 |
| 530819100.0 | 2074.739 | 177.109 | 0.01 |
| 531166950.0 | 2074.863 | 176.224 | 0.009 |
| 531514800.0 | 2074.951 | 175.343 | 0.009 |
| 531862650.0 | 2075.001 | 174.465 | 0.009 |
| 532210500.0 | 2075.014 | 173.591 | 0.009 |
| 532558350.0 | 2074.99 | 172.722 | 0.009 |
| 532906200.0 | 2074.929 | 171.856 | 0.008 |
| 533254050.0 | 2074.83 | 170.993 | 0.008 |
| 533601900.0 | 2074.694 | 170.135 | 0.008 |
| 533949750.0 | 2074.521 | 169.28 | 0.008 |
| 534297600.0 | 2074.31 | 168.429 | 0.008 |
| 534645450.0 | 2074.062 | 167.582 | 0.008 |
| 534993300.0 | 2073.776 | 166.738 | 0.007 |
| 535341150.0 | 2073.453 | 165.898 | 0.007 |
| 535689000.0 | 2073.093 | 165.062 | 0.007 |
| 536036850.0 | 2072.695 | 164.229 | 0.007 |
| 536384700.0 | 2072.259 | 163.4 | 0.007 |
| 536732550.0 | 2071.786 | 162.575 | 0.007 |
| 537080400.0 | 2071.276 | 161.753 | 0.006 |
| 537428250.0 | 2070.727 | 160.935 | 0.006 |
| 537776100.0 | 2070.141 | 160.121 | 0.006 |
| 538123950.0 | 2069.518 | 159.31 | 0.006 |
| 538471800.0 | 2068.857 | 158.502 | 0.006 |
| 538819650.0 | 2068.158 | 157.699 | 0.006 |
| 539167500.0 | 2067.421 | 156.898 | 0.006 |
| 539515350.0 | 2066.647 | 156.101 | 0.006 |
| 539863200.0 | 2065.835 | 155.308 | 0.005 |
| 540211050.0 | 2064.986 | 154.518 | 0.005 |
| 540558900.0 | 2064.098 | 153.731 | 0.005 |
| 540906750.0 | 2063.173 | 152.948 | 0.005 |
| 541254600.0 | 2062.21 | 152.169 | 0.005 |
| 541602450.0 | 2061.21 | 151.393 | 0.005 |
| 541950300.0 | 2060.171 | 150.62 | 0.005 |
| 542298150.0 | 2059.095 | 149.85 | 0.005 |
| 542646000.0 | 2057.981 | 149.084 | 0.005 |
| 542993850.0 | 2056.829 | 148.322 | 0.004 |
| 543341700.0 | 2055.639 | 147.562 | 0.004 |
| 543689550.0 | 2054.411 | 146.806 | 0.004 |
| 544037400.0 | 2053.146 | 146.053 | 0.004 |
| 544385250.0 | 2051.843 | 145.304 | 0.004 |
| 544733100.0 | 2050.501 | 144.558 | 0.004 |
| 545080950.0 | 2049.122 | 143.815 | 0.004 |
| 545428800.0 | 2047.706 | 143.075 | 0.004 |
| 545776650.0 | 2046.251 | 142.339 | 0.004 |
| 546124500.0 | 2044.758 | 141.605 | 0.004 |
| 546472350.0 | 2043.228 | 140.875 | 0.004 |
| 546820200.0 | 2041.66 | 140.149 | 0.003 |
| 547168050.0 | 2040.053 | 139.425 | 0.003 |
| 547515900.0 | 2038.409 | 138.704 | 0.003 |
| 547863750.0 | 2036.728 | 137.987 | 0.003 |
| 548211600.0 | 2035.008 | 137.273 | 0.003 |
| 548559450.0 | 2033.25 | 136.562 | 0.003 |
| 548907300.0 | 2031.455 | 135.854 | 0.003 |
| 549255150.0 | 2029.621 | 135.149 | 0.003 |
| 549603000.0 | 2027.75 | 134.447 | 0.003 |
| 549950850.0 | 2025.841 | 133.748 | 0.003 |
| 550298700.0 | 2023.895 | 133.053 | 0.003 |
| 550646550.0 | 2021.91 | 132.36 | 0.003 |
| 550994400.0 | 2019.888 | 131.67 | 0.003 |
| 551342250.0 | 2017.828 | 130.984 | 0.003 |
| 551690100.0 | 2015.73 | 130.3 | 0.003 |
| 552037950.0 | 2013.594 | 129.62 | 0.002 |
| 552385800.0 | 2011.421 | 128.942 | 0.002 |
| 552733650.0 | 2009.209 | 128.267 | 0.002 |
| 553081500.0 | 2006.96 | 127.596 | 0.002 |
| 553429350.0 | 2004.674 | 126.927 | 0.002 |
| 553777200.0 | 2002.35 | 126.261 | 0.002 |
| 554125050.0 | 1999.988 | 125.598 | 0.002 |
| 554472900.0 | 1997.588 | 124.938 | 0.002 |
| 554820750.0 | 1995.151 | 124.281 | 0.002 |
| 555168600.0 | 1992.676 | 123.627 | 0.002 |
| 555516450.0 | 1990.163 | 122.975 | 0.002 |
| 555864300.0 | 1987.613 | 122.327 | 0.002 |
| 556212150.0 | 1985.025 | 121.681 | 0.002 |
| 556560000.0 | 1982.4 | 121.038 | 0.002 |
| 556907850.0 | 1979.737 | 120.398 | 0.002 |
| 557255700.0 | 1977.037 | 119.76 | 0.002 |
| 557603550.0 | 1974.299 | 119.126 | 0.002 |
| 557951400.0 | 1971.524 | 118.494 | 0.002 |
| 558299250.0 | 1968.712 | 117.865 | 0.002 |
| 558647100.0 | 1965.862 | 117.239 | 0.002 |
| 558994950.0 | 1962.974 | 116.616 | 0.002 |
| 559342800.0 | 1960.049 | 115.995 | 0.002 |
| 559690650.0 | 1957.087 | 115.377 | 0.001 |
| 560038500.0 | 1954.088 | 114.761 | 0.001 |
| 560386350.0 | 1951.052 | 114.149 | 0.001 |
| 560734200.0 | 1947.978 | 113.539 | 0.001 |
| 561082050.0 | 1944.867 | 112.931 | 0.001 |
| 561429900.0 | 1941.719 | 112.327 | 0.001 |
| 561777750.0 | 1938.534 | 111.725 | 0.001 |
| 562125600.0 | 1935.311 | 111.125 | 0.001 |
| 562473450.0 | 1932.052 | 110.528 | 0.001 |
| 562821300.0 | 1928.756 | 109.934 | 0.001 |
| 563169150.0 | 1925.422 | 109.343 | 0.001 |
| 563517000.0 | 1922.052 | 108.754 | 0.001 |
| 563864850.0 | 1918.645 | 108.167 | 0.001 |
| 564212700.0 | 1915.201 | 107.584 | 0.001 |
| 564560550.0 | 1911.72 | 107.002 | 0.001 |
| 564908400.0 | 1908.202 | 106.424 | 0.001 |
| 565256250.0 | 1904.648 | 105.847 | 0.001 |
| 565604100.0 | 1901.057 | 105.274 | 0.001 |
| 565951950.0 | 1897.429 | 104.702 | 0.001 |
| 566299800.0 | 1893.765 | 104.134 | 0.001 |
| 566647650.0 | 1890.064 | 103.568 | 0.001 |
| 566995500.0 | 1886.326 | 103.004 | 0.001 |
| 567343350.0 | 1882.552 | 102.443 | 0.001 |
| 567691200.0 | 1878.742 | 101.884 | 0.001 |
| 568039050.0 | 1874.895 | 101.327 | 0.001 |
| 568386900.0 | 1871.012 | 100.773 | 0.001 |
| 568734750.0 | 1867.093 | 100.222 | 0.001 |
| 569082600.0 | 1863.137 | 99.673 | 0.001 |
| 569430450.0 | 1859.145 | 99.126 | 0.001 |
| 569778300.0 | 1855.117 | 98.582 | 0.001 |
| 570126150.0 | 1851.053 | 98.04 | 0.001 |
| 570474000.0 | 1846.953 | 97.5 | 0.001 |
| 570821850.0 | 1842.817 | 96.963 | 0.001 |
| 571169700.0 | 1838.646 | 96.428 | 0.001 |
| 571517550.0 | 1834.438 | 95.896 | 0.001 |
| 571865400.0 | 1830.194 | 95.366 | 0.001 |
| 572213250.0 | 1825.915 | 94.838 | 0.001 |
| 572561100.0 | 1821.6 | 94.312 | 0.001 |
| 572908950.0 | 1817.249 | 93.789 | 0.001 |
| 573256800.0 | 1812.863 | 93.268 | 0.001 |
| 573604650.0 | 1808.441 | 92.749 | 0.001 |
| 573952500.0 | 1803.984 | 92.233 | 0.001 |
| 574300350.0 | 1799.491 | 91.719 | 0.001 |
| 574648200.0 | 1794.963 | 91.207 | 0.001 |
| 574996050.0 | 1790.4 | 90.697 | 0.001 |
| 575343900.0 | 1785.802 | 90.189 | 0.001 |
| 575691750.0 | 1781.168 | 89.684 | 0.001 |
| 576039600.0 | 1776.5 | 89.181 | 0 |
| 576387450.0 | 1771.796 | 88.68 | 0 |
| 576735300.0 | 1767.058 | 88.182 | 0 |
| 577083150.0 | 1762.284 | 87.685 | 0 |
| 577431000.0 | 1757.476 | 87.191 | 0 |
| 577778850.0 | 1752.633 | 86.699 | 0 |
| 578126700.0 | 1747.755 | 86.209 | 0 |
| 578474550.0 | 1742.843 | 85.721 | 0 |
| 578822400.0 | 1737.897 | 85.235 | 0 |
| 579170250.0 | 1732.915 | 84.752 | 0 |
| 579518100.0 | 1727.9 | 84.27 | 0 |
| 579865950.0 | 1722.85 | 83.791 | 0 |
| 580213800.0 | 1717.766 | 83.314 | 0 |
| 580561650.0 | 1712.648 | 82.838 | 0 |
| 580909500.0 | 1707.495 | 82.365 | 0 |
| 581257350.0 | 1702.309 | 81.894 | 0 |
| 581605200.0 | 1697.089 | 81.425 | 0 |
| 581953050.0 | 1691.835 | 80.958 | 0 |
| 582300900.0 | 1686.547 | 80.493 | 0 |
| 582648750.0 | 1681.226 | 80.031 | 0 |
| 582996600.0 | 1675.87 | 79.57 | 0 |
| 583344450.0 | 1670.482 | 79.111 | 0 |
| 583692300.0 | 1665.06 | 78.654 | 0 |
| 584040150.0 | 1659.604 | 78.199 | 0 |
| 584388000.0 | 1654.116 | 77.747 | 0 |
| 584735850.0 | 1648.594 | 77.296 | 0 |
| 585083700.0 | 1643.039 | 76.847 | 0 |
| 585431550.0 | 1637.451 | 76.4 | 0 |
| 585779400.0 | 1631.83 | 75.955 | 0 |
| 586127250.0 | 1626.177 | 75.512 | 0 |
| 586475100.0 | 1620.49 | 75.071 | 0 |
| 586822950.0 | 1614.771 | 74.632 | 0 |
| 587170800.0 | 1609.019 | 74.194 | 0 |
| 587518650.0 | 1603.235 | 73.759 | 0 |
| 587866500.0 | 1597.419 | 73.326 | 0 |
| 588214350.0 | 1591.57 | 72.894 | 0 |
| 588562200.0 | 1585.689 | 72.465 | 0 |
| 588910050.0 | 1579.776 | 72.037 | 0 |
| 589257900.0 | 1573.831 | 71.611 | 0 |
| 589605750.0 | 1567.854 | 71.187 | 0 |
| 589953600.0 | 1561.845 | 70.765 | 0 |
| 590301450.0 | 1555.805 | 70.344 | 0 |
| 590649300.0 | 1549.732 | 69.926 | 0 |
| 590997150.0 | 1543.629 | 69.509 | 0 |
| 591345000.0 | 1537.494 | 69.094 | 0 |
| 591692850.0 | 1531.327 | 68.681 | 0 |
| 592040700.0 | 1525.13 | 68.27 | 0 |
| 592388550.0 | 1518.901 | 67.861 | 0 |
| 592736400.0 | 1512.641 | 67.453 | 0 |
| 593084250.0 | 1506.351 | 67.047 | 0 |
| 593432100.0 | 1500.029 | 66.643 | 0 |
| 593779950.0 | 1493.677 | 66.241 | 0 |
| 594127800.0 | 1487.294 | 65.84 | 0 |
| 594475650.0 | 1480.881 | 65.442 | 0 |
| 594823500.0 | 1474.438 | 65.045 | 0 |
| 595171350.0 | 1467.964 | 64.649 | 0 |
| 595519200.0 | 1461.46 | 64.256 | 0 |
| 595867050.0 | 1454.926 | 63.864 | 0 |
| 596214900.0 | 1448.362 | 63.474 | 0 |
| 596562750.0 | 1441.768 | 63.085 | 0 |
| 596910600.0 | 1435.144 | 62.699 | 0 |
| 597258450.0 | 1428.491 | 62.313 | 0 |
| 597606300.0 | 1421.808 | 61.93 | 0 |
| 597954150.0 | 1415.096 | 61.548 | 0 |
| 598302000.0 | 1408.355 | 61.168 | 0 |
| 598649850.0 | 1401.585 | 60.79 | 0 |
| 598997700.0 | 1394.785 | 60.413 | 0 |
| 599345550.0 | 1387.957 | 60.038 | 0 |
| 599693400.0 | 1381.1 | 59.665 | 0 |
| 600041250.0 | 1374.214 | 59.293 | 0 |
| 600389100.0 | 1367.299 | 58.923 | 0 |
| 600736950.0 | 1360.357 | 58.554 | 0 |
| 601084800.0 | 1353.386 | 58.187 | 0 |
| 601432650.0 | 1346.386 | 57.822 | 0 |
| 601780500.0 | 1339.359 | 57.458 | 0 |
| 602128350.0 | 1332.304 | 57.096 | 0 |
| 602476200.0 | 1325.221 | 56.736 | 0 |
| 602824050.0 | 1318.11 | 56.377 | 0 |
| 603171900.0 | 1310.971 | 56.019 | 0 |
| 603519750.0 | 1303.806 | 55.663 | 0 |
| 603867600.0 | 1296.612 | 55.309 | 0 |
| 604215450.0 | 1289.392 | 54.956 | 0 |
| 604563300.0 | 1282.145 | 54.605 | 0 |
| 604911150.0 | 1274.871 | 54.255 | 0 |
| 605259000.0 | 1267.57 | 53.907 | 0 |
| 605606850.0 | 1260.242 | 53.561 | 0 |
| 605954700.0 | 1252.888 | 53.215 | 0 |
| 606302550.0 | 1245.507 | 52.872 | 0 |
| 606650400.0 | 1238.1 | 52.53 | 0 |
| 606998250.0 | 1230.667 | 52.189 | 0 |
| 607346100.0 | 1223.208 | 51.85 | 0 |
| 607693950.0 | 1215.723 | 51.512 | 0 |
| 608041800.0 | 1208.213 | 51.176 | 0 |
| 608389650.0 | 1200.677 | 50.842 | 0 |
| 608737500.0 | 1193.115 | 50.508 | 0 |
| 609085350.0 | 1185.528 | 50.177 | 0 |
| 609433200.0 | 1177.916 | 49.846 | 0 |
| 609781050.0 | 1170.279 | 49.517 | 0 |
| 610128900.0 | 1162.617 | 49.19 | 0 |
| 610476750.0 | 1154.931 | 48.864 | 0 |
| 610824600.0 | 1147.22 | 48.539 | 0 |
| 611172450.0 | 1139.484 | 48.216 | 0 |
| 611520300.0 | 1131.724 | 47.895 | 0 |
| 611868150.0 | 1123.94 | 47.574 | 0 |
| 612216000.0 | 1116.132 | 47.255 | 0 |
| 612563850.0 | 1108.3 | 46.938 | 0 |
| 612911700.0 | 1100.444 | 46.622 | 0 |
| 613259550.0 | 1092.565 | 46.307 | 0 |
| 613607400.0 | 1084.662 | 45.993 | 0 |
| 613955250.0 | 1076.736 | 45.681 | 0 |
| 614303100.0 | 1068.787 | 45.371 | 0 |
| 614650950.0 | 1060.815 | 45.061 | 0 |
| 614998800.0 | 1052.821 | 44.753 | 0 |
| 615346650.0 | 1044.803 | 44.447 | 0 |
| 615694500.0 | 1036.763 | 44.142 | 0 |
| 616042350.0 | 1028.701 | 43.838 | 0 |
| 616390200.0 | 1020.616 | 43.535 | 0 |
| 616738050.0 | 1012.51 | 43.234 | 0 |
| 617085900.0 | 1004.382 | 42.934 | 0 |
| 617433750.0 | 996.231 | 42.635 | 0 |
| 617781600.0 | 988.06 | 42.338 | 0 |
| 618129450.0 | 979.867 | 42.042 | 0 |
| 618477300.0 | 971.652 | 41.747 | 0 |
| 618825150.0 | 963.417 | 41.454 | 0 |
| 619173000.0 | 955.161 | 41.161 | 0 |
| 619520850.0 | 946.884 | 40.871 | 0 |
| 619868700.0 | 938.586 | 40.581 | 0 |
| 620216550.0 | 930.268 | 40.293 | 0 |
| 620564400.0 | 921.93 | 40.005 | 0 |
| 620912250.0 | 913.571 | 39.72 | 0 |
| 621260100.0 | 905.193 | 39.435 | 0 |
| 621607950.0 | 896.795 | 39.152 | 0 |
| 621955800.0 | 888.377 | 38.87 | 0 |
| 622303650.0 | 879.94 | 38.589 | 0 |
| 622651500.0 | 871.484 | 38.309 | 0 |
| 622999350.0 | 863.009 | 38.031 | 0 |
| 623347200.0 | 854.514 | 37.753 | 0 |
| 623695050.0 | 846.001 | 37.477 | 0 |
| 624042900.0 | 837.47 | 37.203 | 0 |
| 624390750.0 | 828.92 | 36.929 | 0 |
| 624738600.0 | 820.351 | 36.657 | 0 |
| 625086450.0 | 811.765 | 36.385 | 0 |
| 625434300.0 | 803.161 | 36.115 | 0 |
| 625782150.0 | 794.539 | 35.847 | 0 |
| 626130000.0 | 785.9 | 35.579 | 0 |
| 626477850.0 | 777.243 | 35.312 | 0 |
| 626825700.0 | 768.57 | 35.047 | 0 |
| 627173550.0 | 759.879 | 34.783 | 0 |
| 627521400.0 | 751.171 | 34.52 | 0 |
| 627869250.0 | 742.447 | 34.258 | 0 |
| 628217100.0 | 733.707 | 33.997 | 0 |
| 628564950.0 | 724.95 | 33.738 | 0 |
| 628912800.0 | 716.177 | 33.479 | 0 |
| 629260650.0 | 707.388 | 33.222 | 0 |
| 629608500.0 | 698.584 | 32.966 | 0 |
| 629956350.0 | 689.764 | 32.711 | 0 |
| 630304200.0 | 680.928 | 32.457 | 0 |
| 630652050.0 | 672.078 | 32.204 | 0 |
| 630999900.0 | 663.213 | 31.952 | 0 |
| 631347750.0 | 654.333 | 31.701 | 0 |
| 631695600.0 | 645.438 | 31.452 | 0 |
| 632043450.0 | 636.529 | 31.203 | 0 |
| 632391300.0 | 627.606 | 30.956 | 0 |
| 632739150.0 | 618.669 | 30.71 | 0 |
| 633087000.0 | 609.718 | 30.465 | 0 |
| 633434850.0 | 600.753 | 30.221 | 0 |
| 633782700.0 | 591.775 | 29.977 | 0 |
| 634130550.0 | 582.784 | 29.735 | 0 |
| 634478400.0 | 573.78 | 29.494 | 0 |
| 634826250.0 | 564.763 | 29.255 | 0 |
| 635174100.0 | 555.733 | 29.016 | 0 |
| 635521950.0 | 546.691 | 28.778 | 0 |
| 635869800.0 | 537.637 | 28.541 | 0 |
| 636217650.0 | 528.57 | 28.305 | 0 |
| 636565500.0 | 519.492 | 28.071 | 0 |
| 636913350.0 | 510.403 | 27.837 | 0 |
| 637261200.0 | 501.302 | 27.604 | 0 |
| 637609050.0 | 492.189 | 27.373 | 0 |
| 637956900.0 | 483.066 | 27.142 | 0 |
| 638304750.0 | 473.932 | 26.913 | 0 |
| 638652600.0 | 464.787 | 26.684 | 0 |
| 639000450.0 | 455.632 | 26.456 | 0 |
| 639348300.0 | 446.467 | 26.23 | 0 |
| 639696150.0 | 437.291 | 26.004 | 0 |
| 640044000.0 | 428.106 | 25.78 | 0 |
| 640391850.0 | 418.912 | 25.556 | 0 |
| 640739700.0 | 409.708 | 25.333 | 0 |
| 641087550.0 | 400.495 | 25.111 | 0 |
| 641435400.0 | 391.273 | 24.891 | 0 |
| 641783250.0 | 382.042 | 24.671 | 0 |
| 642131100.0 | 372.803 | 24.452 | 0 |
| 642478950.0 | 363.555 | 24.234 | 0 |
| 642826800.0 | 354.3 | 24.017 | 0 |
| 643174650.0 | 345.036 | 23.801 | 0 |
| 643522500.0 | 335.765 | 23.586 | 0 |
| 643870350.0 | 326.487 | 23.372 | 0 |
| 644218200.0 | 317.201 | 23.159 | 0 |
| 644566050.0 | 307.908 | 22.947 | 0 |
| 644913900.0 | 298.609 | 22.736 | 0 |
| 645261750.0 | 289.303 | 22.525 | 0 |
| 645609600.0 | 279.991 | 22.316 | 0 |
| 645957450.0 | 270.673 | 22.108 | 0 |
| 646305300.0 | 261.348 | 21.9 | 0 |
| 646653150.0 | 252.018 | 21.693 | 0 |
| 647001000.0 | 242.683 | 21.487 | 0 |
| 647348850.0 | 233.343 | 21.283 | 0 |
| 647696700.0 | 223.997 | 21.079 | 0 |
| 648044550.0 | 214.647 | 20.875 | 0 |
| 648392400.0 | 205.292 | 20.673 | 0 |
| 648740250.0 | 195.933 | 20.472 | 0 |
| 649088100.0 | 186.57 | 20.271 | 0 |
| 649435950.0 | 177.203 | 20.072 | 0 |
| 649783800.0 | 167.833 | 19.873 | 0 |
| 650131650.0 | 158.459 | 19.675 | 0 |
| 650479500.0 | 149.082 | 19.478 | 0 |
| 650827350.0 | 139.702 | 19.282 | 0 |
| 651175200.0 | 130.319 | 19.087 | 0 |
| 651523050.0 | 120.934 | 18.893 | 0 |
| 651870900.0 | 111.547 | 18.699 | 0 |
| 652218750.0 | 102.158 | 18.506 | 0 |
| 652566600.0 | 92.767 | 18.315 | 0 |
| 652914450.0 | 83.374 | 18.124 | 0 |
| 653262300.0 | 73.98 | 17.933 | 0 |
| 653610150.0 | 64.586 | 17.744 | 0 |
| 653958000.0 | 55.19 | 17.556 | 0 |
| 654305850.0 | 45.794 | 17.368 | 0 |
| 654653700.0 | 36.398 | 17.181 | 0 |
| 655001550.0 | 27.001 | 16.995 | 0 |
| 655349400.0 | 17.605 | 16.81 | 0 |
| 655697250.0 | 8.21 | 16.625 | 0 |
| 656045100.0 | -1.186 | 16.442 | 0 |
| 656392950.0 | -10.58 | 16.259 | 0 |
| 656740800.0 | -19.973 | 16.077 | 0 |
| 657088650.0 | -29.364 | 15.895 | 0 |
| 657436500.0 | -38.754 | 15.715 | 0 |
| 657784350.0 | -48.142 | 15.535 | 0 |
| 658132200.0 | -57.528 | 15.357 | 0 |
| 658480050.0 | -66.911 | 15.178 | 0 |
| 658827900.0 | -76.292 | 15.001 | 0 |
| 659175750.0 | -85.67 | 14.825 | 0 |
| 659523600.0 | -95.044 | 14.649 | 0 |
| 659871450.0 | -104.416 | 14.474 | 0 |
| 660219300.0 | -113.783 | 14.3 | 0 |
| 660567150.0 | -123.147 | 14.126 | 0 |
| 660915000.0 | -132.506 | 13.953 | 0 |
| 661262850.0 | -141.861 | 13.781 | 0 |
| 661610700.0 | -151.212 | 13.61 | 0 |
| 661958550.0 | -160.557 | 13.44 | 0 |
| 662306400.0 | -169.897 | 13.27 | 0 |
| 662654250.0 | -179.232 | 13.101 | 0 |
| 663002100.0 | -188.561 | 12.933 | 0 |
| 663349950.0 | -197.883 | 12.765 | 0 |
| 663697800.0 | -207.2 | 12.599 | 0 |
| 664045650.0 | -216.51 | 12.433 | 0 |
| 664393500.0 | -225.814 | 12.267 | 0 |
| 664741350.0 | -235.11 | 12.103 | 0 |
| 665089200.0 | -244.399 | 11.939 | 0 |
| 665437050.0 | -253.68 | 11.776 | 0 |
| 665784900.0 | -262.954 | 11.613 | 0 |
| 666132750.0 | -272.219 | 11.452 | 0 |
| 666480600.0 | -281.476 | 11.291 | 0 |
| 666828450.0 | -290.725 | 11.13 | 0 |
| 667176300.0 | -299.964 | 10.971 | 0 |
| 667524150.0 | -309.195 | 10.812 | 0 |
| 667872000.0 | -318.415 | 10.654 | 0 |
| 668219850.0 | -327.626 | 10.496 | 0 |
| 668567700.0 | -336.828 | 10.339 | 0 |
| 668915550.0 | -346.018 | 10.183 | 0 |
| 669263400.0 | -355.199 | 10.028 | 0 |
| 669611250.0 | -364.368 | 9.873 | 0 |
| 669959100.0 | -373.527 | 9.719 | 0 |
| 670306950.0 | -382.674 | 9.565 | 0 |
| 670654800.0 | -391.809 | 9.413 | 0 |
| 671002650.0 | -400.932 | 9.26 | 0 |
| 671350500.0 | -410.043 | 9.109 | 0 |
| 671698350.0 | -419.142 | 8.958 | 0 |
| 672046200.0 | -428.228 | 8.808 | 0 |
| 672394050.0 | -437.301 | 8.659 | 0 |
| 672741900.0 | -446.36 | 8.51 | 0 |
| 673089750.0 | -455.406 | 8.362 | 0 |
| 673437600.0 | -464.438 | 8.214 | 0 |
| 673785450.0 | -473.456 | 8.067 | 0 |
| 674133300.0 | -482.459 | 7.921 | 0 |
| 674481150.0 | -491.448 | 7.776 | 0 |
| 674829000.0 | -500.422 | 7.631 | 0 |
| 675176850.0 | -509.38 | 7.486 | 0 |
| 675524700.0 | -518.322 | 7.343 | 0 |
| 675872550.0 | -527.249 | 7.2 | 0 |
| 676220400.0 | -536.16 | 7.057 | 0 |
| 676568250.0 | -545.054 | 6.915 | 0 |
| 676916100.0 | -553.931 | 6.774 | 0 |
| 677263950.0 | -562.791 | 6.634 | 0 |
| 677611800.0 | -571.634 | 6.494 | 0 |
| 677959650.0 | -580.459 | 6.354 | 0 |
| 678307500.0 | -589.266 | 6.216 | 0 |
| 678655350.0 | -598.055 | 6.077 | 0 |
| 679003200.0 | -606.825 | 5.94 | 0 |
| 679351050.0 | -615.577 | 5.803 | 0 |
| 679698900.0 | -624.309 | 5.667 | 0 |
| 680046750.0 | -633.022 | 5.531 | 0 |
| 680394600.0 | -641.715 | 5.396 | 0 |
| 680742450.0 | -650.389 | 5.261 | 0 |
| 681090300.0 | -659.041 | 5.127 | 0 |
| 681438150.0 | -667.674 | 4.994 | 0 |
| 681786000.0 | -676.285 | 4.861 | 0 |
| 682133850.0 | -684.875 | 4.729 | 0 |
| 682481700.0 | -693.443 | 4.597 | 0 |
| 682829550.0 | -701.99 | 4.466 | 0 |
| 683177400.0 | -710.515 | 4.336 | 0 |
| 683525250.0 | -719.017 | 4.206 | 0 |
| 683873100.0 | -727.496 | 4.077 | 0 |
| 684220950.0 | -735.952 | 3.948 | 0 |
| 684568800.0 | -744.385 | 3.82 | 0 |
| 684916650.0 | -752.794 | 3.692 | 0 |
| 685264500.0 | -761.179 | 3.565 | 0 |
| 685612350.0 | -769.54 | 3.438 | 0 |
| 685960200.0 | -777.876 | 3.312 | 0 |
| 686308050.0 | -786.187 | 3.187 | 0 |
| 686655900.0 | -794.473 | 3.062 | 0 |
| 687003750.0 | -802.733 | 2.938 | 0 |
| 687351600.0 | -810.968 | 2.814 | 0 |
| 687699450.0 | -819.176 | 2.691 | 0 |
| 688047300.0 | -827.358 | 2.568 | 0 |
| 688395150.0 | -835.513 | 2.446 | 0 |
| 688743000.0 | -843.641 | 2.324 | 0 |
| 689090850.0 | -851.741 | 2.203 | 0 |
| 689438700.0 | -859.814 | 2.082 | 0 |
| 689786550.0 | -867.858 | 1.962 | 0 |
| 690134400.0 | -875.874 | 1.843 | 0 |
| 690482250.0 | -883.862 | 1.724 | 0 |
| 690830100.0 | -891.82 | 1.605 | 0 |
| 691177950.0 | -899.749 | 1.487 | 0 |
| 691525800.0 | -907.648 | 1.37 | 0 |
| 691873650.0 | -915.517 | 1.253 | 0 |
| 692221500.0 | -923.355 | 1.137 | 0 |
| 692569350.0 | -931.163 | 1.021 | 0 |
| 692917200.0 | -938.94 | 0.905 | 0 |
| 693265050.0 | -946.686 | 0.79 | 0 |
| 693612900.0 | -954.4 | 0.676 | 0 |
| 693960750.0 | -962.082 | 0.562 | 0 |
| 694308600.0 | -969.732 | 0.449 | 0 |
| 694656450.0 | -977.349 | 0.336 | 0 |
| 695004300.0 | -984.932 | 0.223 | 0 |
| 695352150.0 | -992.483 | 0.111 | 0 |
| 695700000.0 | -1000 | 0 | 0 |